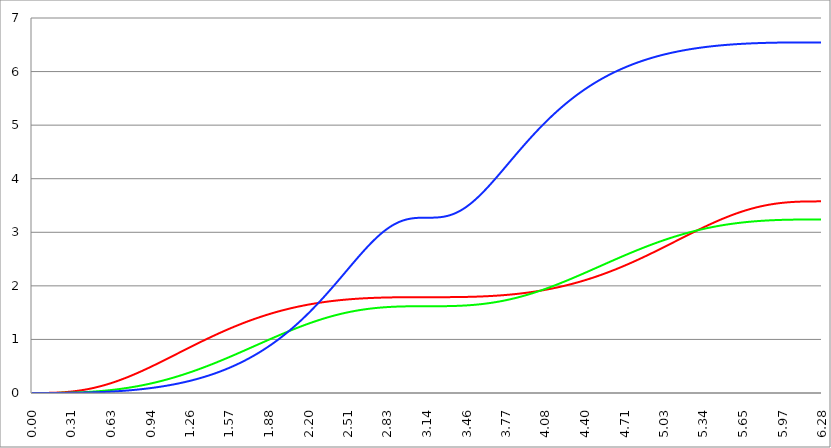
| Category | Series 1 | Series 0 | Series 2 |
|---|---|---|---|
| 0.0 | 0 | 0 | 0 |
| 0.00314159265358979 | 0 | 0 | 0 |
| 0.00628318530717958 | 0 | 0 | 0 |
| 0.00942477796076938 | 0 | 0 | 0 |
| 0.0125663706143592 | 0 | 0 | 0 |
| 0.015707963267949 | 0 | 0 | 0 |
| 0.0188495559215388 | 0 | 0 | 0 |
| 0.0219911485751285 | 0 | 0 | 0 |
| 0.0251327412287183 | 0 | 0 | 0 |
| 0.0282743338823081 | 0 | 0 | 0 |
| 0.0314159265358979 | 0 | 0 | 0 |
| 0.0345575191894877 | 0 | 0 | 0 |
| 0.0376991118430775 | 0 | 0 | 0 |
| 0.0408407044966673 | 0 | 0 | 0 |
| 0.0439822971502571 | 0 | 0 | 0 |
| 0.0471238898038469 | 0 | 0 | 0 |
| 0.0502654824574367 | 0 | 0 | 0 |
| 0.0534070751110265 | 0 | 0 | 0 |
| 0.0565486677646163 | 0 | 0 | 0 |
| 0.059690260418206 | 0 | 0 | 0 |
| 0.0628318530717958 | 0 | 0 | 0 |
| 0.0659734457253856 | 0 | 0 | 0 |
| 0.0691150383789754 | 0 | 0 | 0 |
| 0.0722566310325652 | 0 | 0 | 0 |
| 0.075398223686155 | 0 | 0 | 0 |
| 0.0785398163397448 | 0 | 0 | 0 |
| 0.0816814089933346 | 0.001 | 0 | 0 |
| 0.0848230016469244 | 0.001 | 0 | 0 |
| 0.0879645943005142 | 0.001 | 0 | 0 |
| 0.091106186954104 | 0.001 | 0 | 0 |
| 0.0942477796076937 | 0.001 | 0 | 0 |
| 0.0973893722612835 | 0.001 | 0 | 0 |
| 0.100530964914873 | 0.001 | 0 | 0 |
| 0.103672557568463 | 0.001 | 0 | 0 |
| 0.106814150222053 | 0.001 | 0 | 0 |
| 0.109955742875643 | 0.001 | 0 | 0 |
| 0.113097335529233 | 0.001 | 0 | 0 |
| 0.116238928182822 | 0.001 | 0 | 0 |
| 0.119380520836412 | 0.002 | 0 | 0 |
| 0.122522113490002 | 0.002 | 0 | 0 |
| 0.125663706143592 | 0.002 | 0 | 0 |
| 0.128805298797181 | 0.002 | 0 | 0 |
| 0.131946891450771 | 0.002 | 0.001 | 0 |
| 0.135088484104361 | 0.002 | 0.001 | 0 |
| 0.138230076757951 | 0.002 | 0.001 | 0 |
| 0.141371669411541 | 0.003 | 0.001 | 0 |
| 0.14451326206513 | 0.003 | 0.001 | 0 |
| 0.14765485471872 | 0.003 | 0.001 | 0 |
| 0.15079644737231 | 0.003 | 0.001 | 0 |
| 0.1539380400259 | 0.003 | 0.001 | 0 |
| 0.15707963267949 | 0.004 | 0.001 | 0 |
| 0.160221225333079 | 0.004 | 0.001 | 0 |
| 0.163362817986669 | 0.004 | 0.001 | 0 |
| 0.166504410640259 | 0.004 | 0.001 | 0 |
| 0.169646003293849 | 0.004 | 0.001 | 0.001 |
| 0.172787595947439 | 0.005 | 0.001 | 0.001 |
| 0.175929188601028 | 0.005 | 0.001 | 0.001 |
| 0.179070781254618 | 0.005 | 0.001 | 0.001 |
| 0.182212373908208 | 0.005 | 0.001 | 0.001 |
| 0.185353966561798 | 0.006 | 0.001 | 0.001 |
| 0.188495559215388 | 0.006 | 0.002 | 0.001 |
| 0.191637151868977 | 0.006 | 0.002 | 0.001 |
| 0.194778744522567 | 0.007 | 0.002 | 0.001 |
| 0.197920337176157 | 0.007 | 0.002 | 0.001 |
| 0.201061929829747 | 0.007 | 0.002 | 0.001 |
| 0.204203522483336 | 0.008 | 0.002 | 0.001 |
| 0.207345115136926 | 0.008 | 0.002 | 0.001 |
| 0.210486707790516 | 0.008 | 0.002 | 0.001 |
| 0.213628300444106 | 0.009 | 0.002 | 0.001 |
| 0.216769893097696 | 0.009 | 0.002 | 0.001 |
| 0.219911485751285 | 0.01 | 0.002 | 0.001 |
| 0.223053078404875 | 0.01 | 0.003 | 0.001 |
| 0.226194671058465 | 0.01 | 0.003 | 0.001 |
| 0.229336263712055 | 0.011 | 0.003 | 0.001 |
| 0.232477856365645 | 0.011 | 0.003 | 0.001 |
| 0.235619449019234 | 0.012 | 0.003 | 0.001 |
| 0.238761041672824 | 0.012 | 0.003 | 0.001 |
| 0.241902634326414 | 0.013 | 0.003 | 0.001 |
| 0.245044226980004 | 0.013 | 0.003 | 0.002 |
| 0.248185819633594 | 0.014 | 0.004 | 0.002 |
| 0.251327412287183 | 0.014 | 0.004 | 0.002 |
| 0.254469004940773 | 0.015 | 0.004 | 0.002 |
| 0.257610597594363 | 0.015 | 0.004 | 0.002 |
| 0.260752190247953 | 0.016 | 0.004 | 0.002 |
| 0.263893782901543 | 0.016 | 0.004 | 0.002 |
| 0.267035375555132 | 0.017 | 0.004 | 0.002 |
| 0.270176968208722 | 0.017 | 0.005 | 0.002 |
| 0.273318560862312 | 0.018 | 0.005 | 0.002 |
| 0.276460153515902 | 0.019 | 0.005 | 0.002 |
| 0.279601746169492 | 0.019 | 0.005 | 0.002 |
| 0.282743338823082 | 0.02 | 0.005 | 0.002 |
| 0.285884931476671 | 0.021 | 0.005 | 0.002 |
| 0.289026524130261 | 0.021 | 0.006 | 0.002 |
| 0.292168116783851 | 0.022 | 0.006 | 0.003 |
| 0.295309709437441 | 0.023 | 0.006 | 0.003 |
| 0.298451302091031 | 0.023 | 0.006 | 0.003 |
| 0.30159289474462 | 0.024 | 0.006 | 0.003 |
| 0.30473448739821 | 0.025 | 0.006 | 0.003 |
| 0.3078760800518 | 0.026 | 0.007 | 0.003 |
| 0.31101767270539 | 0.026 | 0.007 | 0.003 |
| 0.31415926535898 | 0.027 | 0.007 | 0.003 |
| 0.31730085801257 | 0.028 | 0.007 | 0.003 |
| 0.320442450666159 | 0.029 | 0.008 | 0.003 |
| 0.323584043319749 | 0.029 | 0.008 | 0.004 |
| 0.326725635973339 | 0.03 | 0.008 | 0.004 |
| 0.329867228626929 | 0.031 | 0.008 | 0.004 |
| 0.333008821280519 | 0.032 | 0.008 | 0.004 |
| 0.336150413934108 | 0.033 | 0.009 | 0.004 |
| 0.339292006587698 | 0.034 | 0.009 | 0.004 |
| 0.342433599241288 | 0.035 | 0.009 | 0.004 |
| 0.345575191894878 | 0.036 | 0.009 | 0.004 |
| 0.348716784548468 | 0.037 | 0.01 | 0.004 |
| 0.351858377202058 | 0.038 | 0.01 | 0.005 |
| 0.354999969855647 | 0.038 | 0.01 | 0.005 |
| 0.358141562509237 | 0.039 | 0.01 | 0.005 |
| 0.361283155162827 | 0.04 | 0.011 | 0.005 |
| 0.364424747816417 | 0.041 | 0.011 | 0.005 |
| 0.367566340470007 | 0.042 | 0.011 | 0.005 |
| 0.370707933123597 | 0.044 | 0.012 | 0.005 |
| 0.373849525777186 | 0.045 | 0.012 | 0.005 |
| 0.376991118430776 | 0.046 | 0.012 | 0.006 |
| 0.380132711084366 | 0.047 | 0.013 | 0.006 |
| 0.383274303737956 | 0.048 | 0.013 | 0.006 |
| 0.386415896391546 | 0.049 | 0.013 | 0.006 |
| 0.389557489045135 | 0.05 | 0.013 | 0.006 |
| 0.392699081698725 | 0.051 | 0.014 | 0.006 |
| 0.395840674352315 | 0.052 | 0.014 | 0.006 |
| 0.398982267005905 | 0.054 | 0.014 | 0.007 |
| 0.402123859659495 | 0.055 | 0.015 | 0.007 |
| 0.405265452313085 | 0.056 | 0.015 | 0.007 |
| 0.408407044966674 | 0.057 | 0.016 | 0.007 |
| 0.411548637620264 | 0.058 | 0.016 | 0.007 |
| 0.414690230273854 | 0.06 | 0.016 | 0.007 |
| 0.417831822927444 | 0.061 | 0.017 | 0.008 |
| 0.420973415581034 | 0.062 | 0.017 | 0.008 |
| 0.424115008234623 | 0.064 | 0.017 | 0.008 |
| 0.427256600888213 | 0.065 | 0.018 | 0.008 |
| 0.430398193541803 | 0.066 | 0.018 | 0.008 |
| 0.433539786195393 | 0.068 | 0.019 | 0.008 |
| 0.436681378848983 | 0.069 | 0.019 | 0.009 |
| 0.439822971502573 | 0.07 | 0.019 | 0.009 |
| 0.442964564156162 | 0.072 | 0.02 | 0.009 |
| 0.446106156809752 | 0.073 | 0.02 | 0.009 |
| 0.449247749463342 | 0.075 | 0.021 | 0.009 |
| 0.452389342116932 | 0.076 | 0.021 | 0.01 |
| 0.455530934770522 | 0.078 | 0.021 | 0.01 |
| 0.458672527424111 | 0.079 | 0.022 | 0.01 |
| 0.461814120077701 | 0.081 | 0.022 | 0.01 |
| 0.464955712731291 | 0.082 | 0.023 | 0.01 |
| 0.468097305384881 | 0.084 | 0.023 | 0.011 |
| 0.471238898038471 | 0.085 | 0.024 | 0.011 |
| 0.474380490692061 | 0.087 | 0.024 | 0.011 |
| 0.47752208334565 | 0.088 | 0.025 | 0.011 |
| 0.48066367599924 | 0.09 | 0.025 | 0.012 |
| 0.48380526865283 | 0.092 | 0.026 | 0.012 |
| 0.48694686130642 | 0.093 | 0.026 | 0.012 |
| 0.49008845396001 | 0.095 | 0.027 | 0.012 |
| 0.493230046613599 | 0.097 | 0.027 | 0.013 |
| 0.496371639267189 | 0.098 | 0.028 | 0.013 |
| 0.499513231920779 | 0.1 | 0.028 | 0.013 |
| 0.502654824574369 | 0.102 | 0.029 | 0.013 |
| 0.505796417227959 | 0.103 | 0.029 | 0.014 |
| 0.508938009881549 | 0.105 | 0.03 | 0.014 |
| 0.512079602535138 | 0.107 | 0.03 | 0.014 |
| 0.515221195188728 | 0.109 | 0.031 | 0.014 |
| 0.518362787842318 | 0.111 | 0.031 | 0.015 |
| 0.521504380495908 | 0.112 | 0.032 | 0.015 |
| 0.524645973149498 | 0.114 | 0.033 | 0.015 |
| 0.527787565803087 | 0.116 | 0.033 | 0.015 |
| 0.530929158456677 | 0.118 | 0.034 | 0.016 |
| 0.534070751110267 | 0.12 | 0.034 | 0.016 |
| 0.537212343763857 | 0.122 | 0.035 | 0.016 |
| 0.540353936417447 | 0.124 | 0.035 | 0.017 |
| 0.543495529071037 | 0.126 | 0.036 | 0.017 |
| 0.546637121724626 | 0.127 | 0.037 | 0.017 |
| 0.549778714378216 | 0.129 | 0.037 | 0.017 |
| 0.552920307031806 | 0.131 | 0.038 | 0.018 |
| 0.556061899685396 | 0.133 | 0.039 | 0.018 |
| 0.559203492338986 | 0.135 | 0.039 | 0.018 |
| 0.562345084992576 | 0.137 | 0.04 | 0.019 |
| 0.565486677646165 | 0.14 | 0.041 | 0.019 |
| 0.568628270299755 | 0.142 | 0.041 | 0.019 |
| 0.571769862953345 | 0.144 | 0.042 | 0.02 |
| 0.574911455606935 | 0.146 | 0.043 | 0.02 |
| 0.578053048260525 | 0.148 | 0.043 | 0.02 |
| 0.581194640914114 | 0.15 | 0.044 | 0.021 |
| 0.584336233567704 | 0.152 | 0.045 | 0.021 |
| 0.587477826221294 | 0.154 | 0.045 | 0.021 |
| 0.590619418874884 | 0.156 | 0.046 | 0.022 |
| 0.593761011528474 | 0.159 | 0.047 | 0.022 |
| 0.596902604182064 | 0.161 | 0.047 | 0.022 |
| 0.600044196835653 | 0.163 | 0.048 | 0.023 |
| 0.603185789489243 | 0.165 | 0.049 | 0.023 |
| 0.606327382142833 | 0.168 | 0.05 | 0.024 |
| 0.609468974796423 | 0.17 | 0.05 | 0.024 |
| 0.612610567450013 | 0.172 | 0.051 | 0.024 |
| 0.615752160103602 | 0.174 | 0.052 | 0.025 |
| 0.618893752757192 | 0.177 | 0.053 | 0.025 |
| 0.622035345410782 | 0.179 | 0.054 | 0.025 |
| 0.625176938064372 | 0.181 | 0.054 | 0.026 |
| 0.628318530717962 | 0.184 | 0.055 | 0.026 |
| 0.631460123371551 | 0.186 | 0.056 | 0.027 |
| 0.634601716025141 | 0.189 | 0.057 | 0.027 |
| 0.637743308678731 | 0.191 | 0.058 | 0.027 |
| 0.640884901332321 | 0.193 | 0.058 | 0.028 |
| 0.644026493985911 | 0.196 | 0.059 | 0.028 |
| 0.647168086639501 | 0.198 | 0.06 | 0.029 |
| 0.65030967929309 | 0.201 | 0.061 | 0.029 |
| 0.65345127194668 | 0.203 | 0.062 | 0.03 |
| 0.65659286460027 | 0.206 | 0.063 | 0.03 |
| 0.65973445725386 | 0.208 | 0.064 | 0.03 |
| 0.66287604990745 | 0.211 | 0.064 | 0.031 |
| 0.666017642561039 | 0.213 | 0.065 | 0.031 |
| 0.669159235214629 | 0.216 | 0.066 | 0.032 |
| 0.672300827868219 | 0.219 | 0.067 | 0.032 |
| 0.675442420521809 | 0.221 | 0.068 | 0.033 |
| 0.678584013175399 | 0.224 | 0.069 | 0.033 |
| 0.681725605828989 | 0.226 | 0.07 | 0.034 |
| 0.684867198482578 | 0.229 | 0.071 | 0.034 |
| 0.688008791136168 | 0.232 | 0.072 | 0.035 |
| 0.691150383789758 | 0.234 | 0.073 | 0.035 |
| 0.694291976443348 | 0.237 | 0.074 | 0.036 |
| 0.697433569096938 | 0.24 | 0.075 | 0.036 |
| 0.700575161750528 | 0.242 | 0.076 | 0.037 |
| 0.703716754404117 | 0.245 | 0.077 | 0.037 |
| 0.706858347057707 | 0.248 | 0.078 | 0.038 |
| 0.709999939711297 | 0.251 | 0.079 | 0.038 |
| 0.713141532364887 | 0.253 | 0.08 | 0.039 |
| 0.716283125018477 | 0.256 | 0.081 | 0.039 |
| 0.719424717672066 | 0.259 | 0.082 | 0.04 |
| 0.722566310325656 | 0.262 | 0.083 | 0.04 |
| 0.725707902979246 | 0.264 | 0.084 | 0.041 |
| 0.728849495632836 | 0.267 | 0.085 | 0.041 |
| 0.731991088286426 | 0.27 | 0.086 | 0.042 |
| 0.735132680940016 | 0.273 | 0.087 | 0.042 |
| 0.738274273593605 | 0.276 | 0.088 | 0.043 |
| 0.741415866247195 | 0.279 | 0.089 | 0.044 |
| 0.744557458900785 | 0.282 | 0.09 | 0.044 |
| 0.747699051554375 | 0.285 | 0.091 | 0.045 |
| 0.750840644207965 | 0.287 | 0.092 | 0.045 |
| 0.753982236861554 | 0.29 | 0.094 | 0.046 |
| 0.757123829515144 | 0.293 | 0.095 | 0.046 |
| 0.760265422168734 | 0.296 | 0.096 | 0.047 |
| 0.763407014822324 | 0.299 | 0.097 | 0.048 |
| 0.766548607475914 | 0.302 | 0.098 | 0.048 |
| 0.769690200129504 | 0.305 | 0.099 | 0.049 |
| 0.772831792783093 | 0.308 | 0.1 | 0.049 |
| 0.775973385436683 | 0.311 | 0.102 | 0.05 |
| 0.779114978090273 | 0.314 | 0.103 | 0.051 |
| 0.782256570743863 | 0.317 | 0.104 | 0.051 |
| 0.785398163397453 | 0.32 | 0.105 | 0.052 |
| 0.788539756051042 | 0.323 | 0.106 | 0.053 |
| 0.791681348704632 | 0.326 | 0.108 | 0.053 |
| 0.794822941358222 | 0.33 | 0.109 | 0.054 |
| 0.797964534011812 | 0.333 | 0.11 | 0.055 |
| 0.801106126665402 | 0.336 | 0.111 | 0.055 |
| 0.804247719318992 | 0.339 | 0.113 | 0.056 |
| 0.807389311972581 | 0.342 | 0.114 | 0.057 |
| 0.810530904626171 | 0.345 | 0.115 | 0.057 |
| 0.813672497279761 | 0.348 | 0.116 | 0.058 |
| 0.816814089933351 | 0.351 | 0.118 | 0.059 |
| 0.819955682586941 | 0.355 | 0.119 | 0.059 |
| 0.823097275240531 | 0.358 | 0.12 | 0.06 |
| 0.82623886789412 | 0.361 | 0.122 | 0.061 |
| 0.82938046054771 | 0.364 | 0.123 | 0.061 |
| 0.8325220532013 | 0.367 | 0.124 | 0.062 |
| 0.83566364585489 | 0.371 | 0.126 | 0.063 |
| 0.83880523850848 | 0.374 | 0.127 | 0.064 |
| 0.841946831162069 | 0.377 | 0.128 | 0.064 |
| 0.845088423815659 | 0.38 | 0.13 | 0.065 |
| 0.848230016469249 | 0.384 | 0.131 | 0.066 |
| 0.851371609122839 | 0.387 | 0.132 | 0.067 |
| 0.854513201776429 | 0.39 | 0.134 | 0.067 |
| 0.857654794430019 | 0.393 | 0.135 | 0.068 |
| 0.860796387083608 | 0.397 | 0.137 | 0.069 |
| 0.863937979737198 | 0.4 | 0.138 | 0.07 |
| 0.867079572390788 | 0.403 | 0.139 | 0.071 |
| 0.870221165044378 | 0.407 | 0.141 | 0.071 |
| 0.873362757697968 | 0.41 | 0.142 | 0.072 |
| 0.876504350351557 | 0.413 | 0.144 | 0.073 |
| 0.879645943005147 | 0.417 | 0.145 | 0.074 |
| 0.882787535658737 | 0.42 | 0.147 | 0.075 |
| 0.885929128312327 | 0.423 | 0.148 | 0.075 |
| 0.889070720965917 | 0.427 | 0.15 | 0.076 |
| 0.892212313619507 | 0.43 | 0.151 | 0.077 |
| 0.895353906273096 | 0.434 | 0.153 | 0.078 |
| 0.898495498926686 | 0.437 | 0.154 | 0.079 |
| 0.901637091580276 | 0.44 | 0.156 | 0.08 |
| 0.904778684233866 | 0.444 | 0.157 | 0.081 |
| 0.907920276887456 | 0.447 | 0.159 | 0.081 |
| 0.911061869541045 | 0.451 | 0.16 | 0.082 |
| 0.914203462194635 | 0.454 | 0.162 | 0.083 |
| 0.917345054848225 | 0.458 | 0.163 | 0.084 |
| 0.920486647501815 | 0.461 | 0.165 | 0.085 |
| 0.923628240155405 | 0.465 | 0.167 | 0.086 |
| 0.926769832808995 | 0.468 | 0.168 | 0.087 |
| 0.929911425462584 | 0.472 | 0.17 | 0.088 |
| 0.933053018116174 | 0.475 | 0.171 | 0.089 |
| 0.936194610769764 | 0.479 | 0.173 | 0.09 |
| 0.939336203423354 | 0.482 | 0.175 | 0.09 |
| 0.942477796076944 | 0.486 | 0.176 | 0.091 |
| 0.945619388730533 | 0.489 | 0.178 | 0.092 |
| 0.948760981384123 | 0.493 | 0.18 | 0.093 |
| 0.951902574037713 | 0.496 | 0.181 | 0.094 |
| 0.955044166691303 | 0.5 | 0.183 | 0.095 |
| 0.958185759344893 | 0.503 | 0.185 | 0.096 |
| 0.961327351998483 | 0.507 | 0.186 | 0.097 |
| 0.964468944652072 | 0.51 | 0.188 | 0.098 |
| 0.967610537305662 | 0.514 | 0.19 | 0.099 |
| 0.970752129959252 | 0.517 | 0.192 | 0.1 |
| 0.973893722612842 | 0.521 | 0.193 | 0.101 |
| 0.977035315266432 | 0.525 | 0.195 | 0.102 |
| 0.980176907920022 | 0.528 | 0.197 | 0.103 |
| 0.983318500573611 | 0.532 | 0.199 | 0.104 |
| 0.986460093227201 | 0.535 | 0.2 | 0.105 |
| 0.989601685880791 | 0.539 | 0.202 | 0.107 |
| 0.992743278534381 | 0.543 | 0.204 | 0.108 |
| 0.995884871187971 | 0.546 | 0.206 | 0.109 |
| 0.99902646384156 | 0.55 | 0.207 | 0.11 |
| 1.00216805649515 | 0.553 | 0.209 | 0.111 |
| 1.00530964914874 | 0.557 | 0.211 | 0.112 |
| 1.00845124180233 | 0.561 | 0.213 | 0.113 |
| 1.01159283445592 | 0.564 | 0.215 | 0.114 |
| 1.01473442710951 | 0.568 | 0.217 | 0.115 |
| 1.017876019763099 | 0.572 | 0.218 | 0.116 |
| 1.021017612416689 | 0.575 | 0.22 | 0.117 |
| 1.02415920507028 | 0.579 | 0.222 | 0.119 |
| 1.027300797723869 | 0.583 | 0.224 | 0.12 |
| 1.030442390377459 | 0.586 | 0.226 | 0.121 |
| 1.033583983031048 | 0.59 | 0.228 | 0.122 |
| 1.036725575684638 | 0.594 | 0.23 | 0.123 |
| 1.039867168338228 | 0.597 | 0.232 | 0.124 |
| 1.043008760991818 | 0.601 | 0.234 | 0.126 |
| 1.046150353645408 | 0.605 | 0.236 | 0.127 |
| 1.049291946298998 | 0.608 | 0.238 | 0.128 |
| 1.052433538952587 | 0.612 | 0.24 | 0.129 |
| 1.055575131606177 | 0.616 | 0.241 | 0.13 |
| 1.058716724259767 | 0.619 | 0.243 | 0.132 |
| 1.061858316913357 | 0.623 | 0.245 | 0.133 |
| 1.064999909566947 | 0.627 | 0.247 | 0.134 |
| 1.068141502220536 | 0.63 | 0.249 | 0.135 |
| 1.071283094874126 | 0.634 | 0.251 | 0.137 |
| 1.074424687527716 | 0.638 | 0.253 | 0.138 |
| 1.077566280181306 | 0.642 | 0.255 | 0.139 |
| 1.080707872834896 | 0.645 | 0.258 | 0.141 |
| 1.083849465488486 | 0.649 | 0.26 | 0.142 |
| 1.086991058142075 | 0.653 | 0.262 | 0.143 |
| 1.090132650795665 | 0.656 | 0.264 | 0.144 |
| 1.093274243449255 | 0.66 | 0.266 | 0.146 |
| 1.096415836102845 | 0.664 | 0.268 | 0.147 |
| 1.099557428756435 | 0.668 | 0.27 | 0.148 |
| 1.102699021410025 | 0.671 | 0.272 | 0.15 |
| 1.105840614063614 | 0.675 | 0.274 | 0.151 |
| 1.108982206717204 | 0.679 | 0.276 | 0.152 |
| 1.112123799370794 | 0.682 | 0.278 | 0.154 |
| 1.115265392024384 | 0.686 | 0.281 | 0.155 |
| 1.118406984677974 | 0.69 | 0.283 | 0.157 |
| 1.121548577331563 | 0.694 | 0.285 | 0.158 |
| 1.124690169985153 | 0.697 | 0.287 | 0.159 |
| 1.127831762638743 | 0.701 | 0.289 | 0.161 |
| 1.130973355292333 | 0.705 | 0.291 | 0.162 |
| 1.134114947945923 | 0.709 | 0.294 | 0.164 |
| 1.137256540599513 | 0.712 | 0.296 | 0.165 |
| 1.140398133253102 | 0.716 | 0.298 | 0.167 |
| 1.143539725906692 | 0.72 | 0.3 | 0.168 |
| 1.146681318560282 | 0.724 | 0.302 | 0.17 |
| 1.149822911213872 | 0.727 | 0.305 | 0.171 |
| 1.152964503867462 | 0.731 | 0.307 | 0.173 |
| 1.156106096521051 | 0.735 | 0.309 | 0.174 |
| 1.159247689174641 | 0.738 | 0.311 | 0.176 |
| 1.162389281828231 | 0.742 | 0.314 | 0.177 |
| 1.165530874481821 | 0.746 | 0.316 | 0.179 |
| 1.168672467135411 | 0.75 | 0.318 | 0.18 |
| 1.171814059789001 | 0.753 | 0.32 | 0.182 |
| 1.17495565244259 | 0.757 | 0.323 | 0.183 |
| 1.17809724509618 | 0.761 | 0.325 | 0.185 |
| 1.18123883774977 | 0.765 | 0.327 | 0.186 |
| 1.18438043040336 | 0.768 | 0.33 | 0.188 |
| 1.18752202305695 | 0.772 | 0.332 | 0.19 |
| 1.190663615710539 | 0.776 | 0.334 | 0.191 |
| 1.193805208364129 | 0.78 | 0.337 | 0.193 |
| 1.19694680101772 | 0.783 | 0.339 | 0.194 |
| 1.200088393671309 | 0.787 | 0.342 | 0.196 |
| 1.203229986324899 | 0.791 | 0.344 | 0.198 |
| 1.206371578978489 | 0.795 | 0.346 | 0.199 |
| 1.209513171632078 | 0.798 | 0.349 | 0.201 |
| 1.212654764285668 | 0.802 | 0.351 | 0.203 |
| 1.215796356939258 | 0.806 | 0.353 | 0.204 |
| 1.218937949592848 | 0.809 | 0.356 | 0.206 |
| 1.222079542246438 | 0.813 | 0.358 | 0.208 |
| 1.225221134900027 | 0.817 | 0.361 | 0.209 |
| 1.228362727553617 | 0.821 | 0.363 | 0.211 |
| 1.231504320207207 | 0.824 | 0.366 | 0.213 |
| 1.234645912860797 | 0.828 | 0.368 | 0.215 |
| 1.237787505514387 | 0.832 | 0.371 | 0.216 |
| 1.240929098167977 | 0.835 | 0.373 | 0.218 |
| 1.244070690821566 | 0.839 | 0.376 | 0.22 |
| 1.247212283475156 | 0.843 | 0.378 | 0.222 |
| 1.250353876128746 | 0.847 | 0.381 | 0.224 |
| 1.253495468782336 | 0.85 | 0.383 | 0.225 |
| 1.256637061435926 | 0.854 | 0.386 | 0.227 |
| 1.259778654089515 | 0.858 | 0.388 | 0.229 |
| 1.262920246743105 | 0.861 | 0.391 | 0.231 |
| 1.266061839396695 | 0.865 | 0.393 | 0.233 |
| 1.269203432050285 | 0.869 | 0.396 | 0.235 |
| 1.272345024703875 | 0.872 | 0.398 | 0.236 |
| 1.275486617357465 | 0.876 | 0.401 | 0.238 |
| 1.278628210011054 | 0.88 | 0.403 | 0.24 |
| 1.281769802664644 | 0.884 | 0.406 | 0.242 |
| 1.284911395318234 | 0.887 | 0.409 | 0.244 |
| 1.288052987971824 | 0.891 | 0.411 | 0.246 |
| 1.291194580625414 | 0.895 | 0.414 | 0.248 |
| 1.294336173279003 | 0.898 | 0.416 | 0.25 |
| 1.297477765932593 | 0.902 | 0.419 | 0.252 |
| 1.300619358586183 | 0.906 | 0.422 | 0.254 |
| 1.303760951239773 | 0.909 | 0.424 | 0.256 |
| 1.306902543893363 | 0.913 | 0.427 | 0.258 |
| 1.310044136546953 | 0.916 | 0.43 | 0.26 |
| 1.313185729200542 | 0.92 | 0.432 | 0.262 |
| 1.316327321854132 | 0.924 | 0.435 | 0.264 |
| 1.319468914507722 | 0.927 | 0.438 | 0.266 |
| 1.322610507161312 | 0.931 | 0.44 | 0.268 |
| 1.325752099814902 | 0.935 | 0.443 | 0.27 |
| 1.328893692468491 | 0.938 | 0.446 | 0.272 |
| 1.332035285122081 | 0.942 | 0.448 | 0.274 |
| 1.335176877775671 | 0.946 | 0.451 | 0.276 |
| 1.338318470429261 | 0.949 | 0.454 | 0.278 |
| 1.341460063082851 | 0.953 | 0.456 | 0.281 |
| 1.344601655736441 | 0.956 | 0.459 | 0.283 |
| 1.34774324839003 | 0.96 | 0.462 | 0.285 |
| 1.35088484104362 | 0.964 | 0.465 | 0.287 |
| 1.35402643369721 | 0.967 | 0.467 | 0.289 |
| 1.3571680263508 | 0.971 | 0.47 | 0.291 |
| 1.36030961900439 | 0.974 | 0.473 | 0.294 |
| 1.363451211657979 | 0.978 | 0.476 | 0.296 |
| 1.36659280431157 | 0.981 | 0.478 | 0.298 |
| 1.369734396965159 | 0.985 | 0.481 | 0.3 |
| 1.372875989618749 | 0.989 | 0.484 | 0.303 |
| 1.376017582272339 | 0.992 | 0.487 | 0.305 |
| 1.379159174925929 | 0.996 | 0.49 | 0.307 |
| 1.382300767579518 | 0.999 | 0.492 | 0.309 |
| 1.385442360233108 | 1.003 | 0.495 | 0.312 |
| 1.388583952886698 | 1.006 | 0.498 | 0.314 |
| 1.391725545540288 | 1.01 | 0.501 | 0.316 |
| 1.394867138193878 | 1.013 | 0.504 | 0.319 |
| 1.398008730847468 | 1.017 | 0.507 | 0.321 |
| 1.401150323501057 | 1.02 | 0.509 | 0.323 |
| 1.404291916154647 | 1.024 | 0.512 | 0.326 |
| 1.407433508808237 | 1.027 | 0.515 | 0.328 |
| 1.410575101461827 | 1.031 | 0.518 | 0.331 |
| 1.413716694115417 | 1.034 | 0.521 | 0.333 |
| 1.416858286769006 | 1.038 | 0.524 | 0.335 |
| 1.419999879422596 | 1.041 | 0.527 | 0.338 |
| 1.423141472076186 | 1.045 | 0.53 | 0.34 |
| 1.426283064729776 | 1.048 | 0.533 | 0.343 |
| 1.429424657383366 | 1.052 | 0.535 | 0.345 |
| 1.432566250036956 | 1.055 | 0.538 | 0.348 |
| 1.435707842690545 | 1.059 | 0.541 | 0.35 |
| 1.438849435344135 | 1.062 | 0.544 | 0.353 |
| 1.441991027997725 | 1.066 | 0.547 | 0.355 |
| 1.445132620651315 | 1.069 | 0.55 | 0.358 |
| 1.448274213304905 | 1.072 | 0.553 | 0.36 |
| 1.451415805958494 | 1.076 | 0.556 | 0.363 |
| 1.454557398612084 | 1.079 | 0.559 | 0.366 |
| 1.457698991265674 | 1.083 | 0.562 | 0.368 |
| 1.460840583919264 | 1.086 | 0.565 | 0.371 |
| 1.463982176572854 | 1.089 | 0.568 | 0.373 |
| 1.467123769226444 | 1.093 | 0.571 | 0.376 |
| 1.470265361880033 | 1.096 | 0.574 | 0.379 |
| 1.473406954533623 | 1.1 | 0.577 | 0.381 |
| 1.476548547187213 | 1.103 | 0.58 | 0.384 |
| 1.479690139840803 | 1.106 | 0.583 | 0.387 |
| 1.482831732494393 | 1.11 | 0.586 | 0.389 |
| 1.485973325147982 | 1.113 | 0.589 | 0.392 |
| 1.489114917801572 | 1.116 | 0.592 | 0.395 |
| 1.492256510455162 | 1.12 | 0.595 | 0.398 |
| 1.495398103108752 | 1.123 | 0.598 | 0.4 |
| 1.498539695762342 | 1.126 | 0.601 | 0.403 |
| 1.501681288415932 | 1.13 | 0.604 | 0.406 |
| 1.504822881069521 | 1.133 | 0.607 | 0.409 |
| 1.507964473723111 | 1.136 | 0.61 | 0.412 |
| 1.511106066376701 | 1.139 | 0.613 | 0.415 |
| 1.514247659030291 | 1.143 | 0.616 | 0.417 |
| 1.517389251683881 | 1.146 | 0.619 | 0.42 |
| 1.520530844337471 | 1.149 | 0.622 | 0.423 |
| 1.52367243699106 | 1.153 | 0.625 | 0.426 |
| 1.52681402964465 | 1.156 | 0.628 | 0.429 |
| 1.52995562229824 | 1.159 | 0.632 | 0.432 |
| 1.53309721495183 | 1.162 | 0.635 | 0.435 |
| 1.53623880760542 | 1.166 | 0.638 | 0.438 |
| 1.539380400259009 | 1.169 | 0.641 | 0.441 |
| 1.542521992912599 | 1.172 | 0.644 | 0.444 |
| 1.545663585566189 | 1.175 | 0.647 | 0.447 |
| 1.548805178219779 | 1.178 | 0.65 | 0.45 |
| 1.551946770873369 | 1.182 | 0.653 | 0.453 |
| 1.555088363526959 | 1.185 | 0.656 | 0.456 |
| 1.558229956180548 | 1.188 | 0.659 | 0.459 |
| 1.561371548834138 | 1.191 | 0.663 | 0.462 |
| 1.564513141487728 | 1.194 | 0.666 | 0.465 |
| 1.567654734141318 | 1.197 | 0.669 | 0.468 |
| 1.570796326794908 | 1.201 | 0.672 | 0.471 |
| 1.573937919448497 | 1.204 | 0.675 | 0.475 |
| 1.577079512102087 | 1.207 | 0.678 | 0.478 |
| 1.580221104755677 | 1.21 | 0.681 | 0.481 |
| 1.583362697409267 | 1.213 | 0.685 | 0.484 |
| 1.586504290062857 | 1.216 | 0.688 | 0.487 |
| 1.589645882716447 | 1.219 | 0.691 | 0.491 |
| 1.592787475370036 | 1.222 | 0.694 | 0.494 |
| 1.595929068023626 | 1.225 | 0.697 | 0.497 |
| 1.599070660677216 | 1.228 | 0.7 | 0.5 |
| 1.602212253330806 | 1.232 | 0.704 | 0.504 |
| 1.605353845984396 | 1.235 | 0.707 | 0.507 |
| 1.608495438637985 | 1.238 | 0.71 | 0.51 |
| 1.611637031291575 | 1.241 | 0.713 | 0.514 |
| 1.614778623945165 | 1.244 | 0.716 | 0.517 |
| 1.617920216598755 | 1.247 | 0.72 | 0.52 |
| 1.621061809252345 | 1.25 | 0.723 | 0.524 |
| 1.624203401905935 | 1.253 | 0.726 | 0.527 |
| 1.627344994559524 | 1.256 | 0.729 | 0.531 |
| 1.630486587213114 | 1.259 | 0.732 | 0.534 |
| 1.633628179866704 | 1.262 | 0.736 | 0.537 |
| 1.636769772520294 | 1.265 | 0.739 | 0.541 |
| 1.639911365173884 | 1.268 | 0.742 | 0.544 |
| 1.643052957827473 | 1.271 | 0.745 | 0.548 |
| 1.646194550481063 | 1.274 | 0.748 | 0.551 |
| 1.649336143134653 | 1.277 | 0.752 | 0.555 |
| 1.652477735788243 | 1.279 | 0.755 | 0.559 |
| 1.655619328441833 | 1.282 | 0.758 | 0.562 |
| 1.658760921095423 | 1.285 | 0.761 | 0.566 |
| 1.661902513749012 | 1.288 | 0.765 | 0.569 |
| 1.665044106402602 | 1.291 | 0.768 | 0.573 |
| 1.668185699056192 | 1.294 | 0.771 | 0.577 |
| 1.671327291709782 | 1.297 | 0.774 | 0.58 |
| 1.674468884363372 | 1.3 | 0.778 | 0.584 |
| 1.677610477016961 | 1.303 | 0.781 | 0.588 |
| 1.680752069670551 | 1.305 | 0.784 | 0.591 |
| 1.683893662324141 | 1.308 | 0.787 | 0.595 |
| 1.687035254977731 | 1.311 | 0.79 | 0.599 |
| 1.690176847631321 | 1.314 | 0.794 | 0.603 |
| 1.693318440284911 | 1.317 | 0.797 | 0.607 |
| 1.6964600329385 | 1.32 | 0.8 | 0.61 |
| 1.69960162559209 | 1.322 | 0.803 | 0.614 |
| 1.70274321824568 | 1.325 | 0.807 | 0.618 |
| 1.70588481089927 | 1.328 | 0.81 | 0.622 |
| 1.70902640355286 | 1.331 | 0.813 | 0.626 |
| 1.712167996206449 | 1.333 | 0.817 | 0.63 |
| 1.715309588860039 | 1.336 | 0.82 | 0.634 |
| 1.71845118151363 | 1.339 | 0.823 | 0.638 |
| 1.721592774167219 | 1.342 | 0.826 | 0.641 |
| 1.724734366820809 | 1.344 | 0.83 | 0.645 |
| 1.727875959474399 | 1.347 | 0.833 | 0.649 |
| 1.731017552127988 | 1.35 | 0.836 | 0.653 |
| 1.734159144781578 | 1.353 | 0.839 | 0.657 |
| 1.737300737435168 | 1.355 | 0.843 | 0.662 |
| 1.740442330088758 | 1.358 | 0.846 | 0.666 |
| 1.743583922742348 | 1.361 | 0.849 | 0.67 |
| 1.746725515395937 | 1.363 | 0.852 | 0.674 |
| 1.749867108049527 | 1.366 | 0.856 | 0.678 |
| 1.753008700703117 | 1.369 | 0.859 | 0.682 |
| 1.756150293356707 | 1.371 | 0.862 | 0.686 |
| 1.759291886010297 | 1.374 | 0.866 | 0.69 |
| 1.762433478663887 | 1.376 | 0.869 | 0.695 |
| 1.765575071317476 | 1.379 | 0.872 | 0.699 |
| 1.768716663971066 | 1.382 | 0.875 | 0.703 |
| 1.771858256624656 | 1.384 | 0.879 | 0.707 |
| 1.774999849278246 | 1.387 | 0.882 | 0.712 |
| 1.778141441931836 | 1.389 | 0.885 | 0.716 |
| 1.781283034585426 | 1.392 | 0.888 | 0.72 |
| 1.784424627239015 | 1.395 | 0.892 | 0.725 |
| 1.787566219892605 | 1.397 | 0.895 | 0.729 |
| 1.790707812546195 | 1.4 | 0.898 | 0.733 |
| 1.793849405199785 | 1.402 | 0.902 | 0.738 |
| 1.796990997853375 | 1.405 | 0.905 | 0.742 |
| 1.800132590506964 | 1.407 | 0.908 | 0.747 |
| 1.803274183160554 | 1.41 | 0.911 | 0.751 |
| 1.806415775814144 | 1.412 | 0.915 | 0.756 |
| 1.809557368467734 | 1.415 | 0.918 | 0.76 |
| 1.812698961121324 | 1.417 | 0.921 | 0.765 |
| 1.815840553774914 | 1.42 | 0.924 | 0.769 |
| 1.818982146428503 | 1.422 | 0.928 | 0.774 |
| 1.822123739082093 | 1.424 | 0.931 | 0.778 |
| 1.825265331735683 | 1.427 | 0.934 | 0.783 |
| 1.828406924389273 | 1.429 | 0.937 | 0.788 |
| 1.831548517042863 | 1.432 | 0.941 | 0.792 |
| 1.834690109696452 | 1.434 | 0.944 | 0.797 |
| 1.837831702350042 | 1.437 | 0.947 | 0.801 |
| 1.840973295003632 | 1.439 | 0.95 | 0.806 |
| 1.844114887657222 | 1.441 | 0.954 | 0.811 |
| 1.847256480310812 | 1.444 | 0.957 | 0.816 |
| 1.850398072964402 | 1.446 | 0.96 | 0.82 |
| 1.853539665617991 | 1.448 | 0.964 | 0.825 |
| 1.856681258271581 | 1.451 | 0.967 | 0.83 |
| 1.859822850925171 | 1.453 | 0.97 | 0.835 |
| 1.862964443578761 | 1.455 | 0.973 | 0.84 |
| 1.866106036232351 | 1.458 | 0.976 | 0.845 |
| 1.86924762888594 | 1.46 | 0.98 | 0.85 |
| 1.87238922153953 | 1.462 | 0.983 | 0.854 |
| 1.87553081419312 | 1.465 | 0.986 | 0.859 |
| 1.87867240684671 | 1.467 | 0.989 | 0.864 |
| 1.8818139995003 | 1.469 | 0.993 | 0.869 |
| 1.88495559215389 | 1.471 | 0.996 | 0.874 |
| 1.888097184807479 | 1.474 | 0.999 | 0.879 |
| 1.891238777461069 | 1.476 | 1.002 | 0.884 |
| 1.89438037011466 | 1.478 | 1.006 | 0.889 |
| 1.897521962768249 | 1.48 | 1.009 | 0.895 |
| 1.900663555421839 | 1.483 | 1.012 | 0.9 |
| 1.903805148075429 | 1.485 | 1.015 | 0.905 |
| 1.906946740729018 | 1.487 | 1.018 | 0.91 |
| 1.910088333382608 | 1.489 | 1.022 | 0.915 |
| 1.913229926036198 | 1.491 | 1.025 | 0.92 |
| 1.916371518689788 | 1.493 | 1.028 | 0.926 |
| 1.919513111343378 | 1.496 | 1.031 | 0.931 |
| 1.922654703996967 | 1.498 | 1.034 | 0.936 |
| 1.925796296650557 | 1.5 | 1.038 | 0.941 |
| 1.928937889304147 | 1.502 | 1.041 | 0.947 |
| 1.932079481957737 | 1.504 | 1.044 | 0.952 |
| 1.935221074611327 | 1.506 | 1.047 | 0.957 |
| 1.938362667264917 | 1.508 | 1.05 | 0.963 |
| 1.941504259918506 | 1.51 | 1.054 | 0.968 |
| 1.944645852572096 | 1.512 | 1.057 | 0.974 |
| 1.947787445225686 | 1.515 | 1.06 | 0.979 |
| 1.950929037879276 | 1.517 | 1.063 | 0.984 |
| 1.954070630532866 | 1.519 | 1.066 | 0.99 |
| 1.957212223186455 | 1.521 | 1.069 | 0.995 |
| 1.960353815840045 | 1.523 | 1.073 | 1.001 |
| 1.963495408493635 | 1.525 | 1.076 | 1.007 |
| 1.966637001147225 | 1.527 | 1.079 | 1.012 |
| 1.969778593800815 | 1.529 | 1.082 | 1.018 |
| 1.972920186454405 | 1.531 | 1.085 | 1.023 |
| 1.976061779107994 | 1.533 | 1.088 | 1.029 |
| 1.979203371761584 | 1.535 | 1.091 | 1.035 |
| 1.982344964415174 | 1.537 | 1.094 | 1.04 |
| 1.985486557068764 | 1.539 | 1.098 | 1.046 |
| 1.988628149722354 | 1.541 | 1.101 | 1.052 |
| 1.991769742375943 | 1.542 | 1.104 | 1.058 |
| 1.994911335029533 | 1.544 | 1.107 | 1.063 |
| 1.998052927683123 | 1.546 | 1.11 | 1.069 |
| 2.001194520336712 | 1.548 | 1.113 | 1.075 |
| 2.004336112990302 | 1.55 | 1.116 | 1.081 |
| 2.007477705643892 | 1.552 | 1.119 | 1.087 |
| 2.010619298297482 | 1.554 | 1.122 | 1.093 |
| 2.013760890951071 | 1.556 | 1.125 | 1.099 |
| 2.016902483604661 | 1.558 | 1.128 | 1.105 |
| 2.02004407625825 | 1.56 | 1.132 | 1.111 |
| 2.02318566891184 | 1.561 | 1.135 | 1.117 |
| 2.02632726156543 | 1.563 | 1.138 | 1.123 |
| 2.029468854219019 | 1.565 | 1.141 | 1.129 |
| 2.032610446872609 | 1.567 | 1.144 | 1.135 |
| 2.035752039526198 | 1.569 | 1.147 | 1.141 |
| 2.038893632179788 | 1.57 | 1.15 | 1.147 |
| 2.042035224833378 | 1.572 | 1.153 | 1.153 |
| 2.045176817486967 | 1.574 | 1.156 | 1.159 |
| 2.048318410140557 | 1.576 | 1.159 | 1.165 |
| 2.051460002794146 | 1.578 | 1.162 | 1.172 |
| 2.054601595447736 | 1.579 | 1.165 | 1.178 |
| 2.057743188101325 | 1.581 | 1.168 | 1.184 |
| 2.060884780754915 | 1.583 | 1.171 | 1.19 |
| 2.064026373408505 | 1.585 | 1.174 | 1.197 |
| 2.067167966062094 | 1.586 | 1.177 | 1.203 |
| 2.070309558715684 | 1.588 | 1.18 | 1.209 |
| 2.073451151369273 | 1.59 | 1.183 | 1.216 |
| 2.076592744022863 | 1.591 | 1.186 | 1.222 |
| 2.079734336676452 | 1.593 | 1.189 | 1.229 |
| 2.082875929330042 | 1.595 | 1.191 | 1.235 |
| 2.086017521983632 | 1.596 | 1.194 | 1.241 |
| 2.089159114637221 | 1.598 | 1.197 | 1.248 |
| 2.092300707290811 | 1.6 | 1.2 | 1.254 |
| 2.095442299944401 | 1.601 | 1.203 | 1.261 |
| 2.09858389259799 | 1.603 | 1.206 | 1.268 |
| 2.10172548525158 | 1.605 | 1.209 | 1.274 |
| 2.104867077905169 | 1.606 | 1.212 | 1.281 |
| 2.108008670558759 | 1.608 | 1.215 | 1.287 |
| 2.111150263212349 | 1.609 | 1.218 | 1.294 |
| 2.114291855865938 | 1.611 | 1.22 | 1.301 |
| 2.117433448519528 | 1.613 | 1.223 | 1.307 |
| 2.120575041173117 | 1.614 | 1.226 | 1.314 |
| 2.123716633826707 | 1.616 | 1.229 | 1.321 |
| 2.126858226480297 | 1.617 | 1.232 | 1.328 |
| 2.129999819133886 | 1.619 | 1.235 | 1.335 |
| 2.133141411787476 | 1.62 | 1.237 | 1.341 |
| 2.136283004441065 | 1.622 | 1.24 | 1.348 |
| 2.139424597094655 | 1.623 | 1.243 | 1.355 |
| 2.142566189748245 | 1.625 | 1.246 | 1.362 |
| 2.145707782401834 | 1.626 | 1.249 | 1.369 |
| 2.148849375055424 | 1.628 | 1.251 | 1.376 |
| 2.151990967709013 | 1.629 | 1.254 | 1.383 |
| 2.155132560362603 | 1.631 | 1.257 | 1.39 |
| 2.158274153016193 | 1.632 | 1.26 | 1.397 |
| 2.161415745669782 | 1.634 | 1.263 | 1.404 |
| 2.164557338323372 | 1.635 | 1.265 | 1.411 |
| 2.167698930976961 | 1.637 | 1.268 | 1.418 |
| 2.170840523630551 | 1.638 | 1.271 | 1.425 |
| 2.173982116284141 | 1.639 | 1.273 | 1.432 |
| 2.17712370893773 | 1.641 | 1.276 | 1.439 |
| 2.18026530159132 | 1.642 | 1.279 | 1.447 |
| 2.183406894244909 | 1.644 | 1.282 | 1.454 |
| 2.186548486898499 | 1.645 | 1.284 | 1.461 |
| 2.189690079552089 | 1.646 | 1.287 | 1.468 |
| 2.192831672205678 | 1.648 | 1.29 | 1.475 |
| 2.195973264859268 | 1.649 | 1.292 | 1.483 |
| 2.199114857512857 | 1.65 | 1.295 | 1.49 |
| 2.202256450166447 | 1.652 | 1.297 | 1.497 |
| 2.205398042820036 | 1.653 | 1.3 | 1.505 |
| 2.208539635473626 | 1.654 | 1.303 | 1.512 |
| 2.211681228127216 | 1.656 | 1.305 | 1.52 |
| 2.214822820780805 | 1.657 | 1.308 | 1.527 |
| 2.217964413434395 | 1.658 | 1.311 | 1.534 |
| 2.221106006087984 | 1.66 | 1.313 | 1.542 |
| 2.224247598741574 | 1.661 | 1.316 | 1.549 |
| 2.227389191395164 | 1.662 | 1.318 | 1.557 |
| 2.230530784048753 | 1.664 | 1.321 | 1.564 |
| 2.233672376702343 | 1.665 | 1.323 | 1.572 |
| 2.236813969355933 | 1.666 | 1.326 | 1.58 |
| 2.239955562009522 | 1.667 | 1.328 | 1.587 |
| 2.243097154663112 | 1.668 | 1.331 | 1.595 |
| 2.246238747316701 | 1.67 | 1.333 | 1.602 |
| 2.249380339970291 | 1.671 | 1.336 | 1.61 |
| 2.252521932623881 | 1.672 | 1.338 | 1.618 |
| 2.25566352527747 | 1.673 | 1.341 | 1.626 |
| 2.25880511793106 | 1.675 | 1.343 | 1.633 |
| 2.261946710584649 | 1.676 | 1.346 | 1.641 |
| 2.265088303238239 | 1.677 | 1.348 | 1.649 |
| 2.268229895891829 | 1.678 | 1.351 | 1.657 |
| 2.271371488545418 | 1.679 | 1.353 | 1.664 |
| 2.274513081199008 | 1.68 | 1.356 | 1.672 |
| 2.277654673852597 | 1.682 | 1.358 | 1.68 |
| 2.280796266506186 | 1.683 | 1.36 | 1.688 |
| 2.283937859159776 | 1.684 | 1.363 | 1.696 |
| 2.287079451813366 | 1.685 | 1.365 | 1.704 |
| 2.290221044466955 | 1.686 | 1.367 | 1.712 |
| 2.293362637120545 | 1.687 | 1.37 | 1.72 |
| 2.296504229774135 | 1.688 | 1.372 | 1.728 |
| 2.299645822427724 | 1.689 | 1.374 | 1.736 |
| 2.302787415081314 | 1.69 | 1.377 | 1.744 |
| 2.305929007734904 | 1.692 | 1.379 | 1.752 |
| 2.309070600388493 | 1.693 | 1.381 | 1.76 |
| 2.312212193042083 | 1.694 | 1.384 | 1.768 |
| 2.315353785695672 | 1.695 | 1.386 | 1.776 |
| 2.318495378349262 | 1.696 | 1.388 | 1.784 |
| 2.321636971002852 | 1.697 | 1.39 | 1.792 |
| 2.324778563656441 | 1.698 | 1.393 | 1.8 |
| 2.327920156310031 | 1.699 | 1.395 | 1.809 |
| 2.33106174896362 | 1.7 | 1.397 | 1.817 |
| 2.33420334161721 | 1.701 | 1.399 | 1.825 |
| 2.3373449342708 | 1.702 | 1.402 | 1.833 |
| 2.340486526924389 | 1.703 | 1.404 | 1.841 |
| 2.343628119577979 | 1.704 | 1.406 | 1.85 |
| 2.346769712231568 | 1.705 | 1.408 | 1.858 |
| 2.349911304885158 | 1.706 | 1.41 | 1.866 |
| 2.353052897538748 | 1.707 | 1.412 | 1.875 |
| 2.356194490192337 | 1.708 | 1.415 | 1.883 |
| 2.359336082845927 | 1.709 | 1.417 | 1.891 |
| 2.362477675499516 | 1.71 | 1.419 | 1.9 |
| 2.365619268153106 | 1.711 | 1.421 | 1.908 |
| 2.368760860806696 | 1.712 | 1.423 | 1.916 |
| 2.371902453460285 | 1.712 | 1.425 | 1.925 |
| 2.375044046113875 | 1.713 | 1.427 | 1.933 |
| 2.378185638767464 | 1.714 | 1.429 | 1.942 |
| 2.381327231421054 | 1.715 | 1.431 | 1.95 |
| 2.384468824074644 | 1.716 | 1.433 | 1.958 |
| 2.387610416728233 | 1.717 | 1.435 | 1.967 |
| 2.390752009381823 | 1.718 | 1.437 | 1.975 |
| 2.393893602035412 | 1.719 | 1.439 | 1.984 |
| 2.397035194689002 | 1.72 | 1.441 | 1.992 |
| 2.400176787342591 | 1.72 | 1.443 | 2.001 |
| 2.403318379996181 | 1.721 | 1.445 | 2.009 |
| 2.406459972649771 | 1.722 | 1.447 | 2.018 |
| 2.40960156530336 | 1.723 | 1.449 | 2.027 |
| 2.41274315795695 | 1.724 | 1.451 | 2.035 |
| 2.41588475061054 | 1.725 | 1.453 | 2.044 |
| 2.419026343264129 | 1.725 | 1.455 | 2.052 |
| 2.422167935917719 | 1.726 | 1.457 | 2.061 |
| 2.425309528571308 | 1.727 | 1.459 | 2.069 |
| 2.428451121224898 | 1.728 | 1.461 | 2.078 |
| 2.431592713878488 | 1.729 | 1.462 | 2.087 |
| 2.434734306532077 | 1.729 | 1.464 | 2.095 |
| 2.437875899185667 | 1.73 | 1.466 | 2.104 |
| 2.441017491839256 | 1.731 | 1.468 | 2.113 |
| 2.444159084492846 | 1.732 | 1.47 | 2.121 |
| 2.447300677146435 | 1.732 | 1.472 | 2.13 |
| 2.450442269800025 | 1.733 | 1.473 | 2.139 |
| 2.453583862453615 | 1.734 | 1.475 | 2.147 |
| 2.456725455107204 | 1.735 | 1.477 | 2.156 |
| 2.459867047760794 | 1.735 | 1.479 | 2.165 |
| 2.463008640414384 | 1.736 | 1.48 | 2.173 |
| 2.466150233067973 | 1.737 | 1.482 | 2.182 |
| 2.469291825721563 | 1.738 | 1.484 | 2.191 |
| 2.472433418375152 | 1.738 | 1.486 | 2.199 |
| 2.475575011028742 | 1.739 | 1.487 | 2.208 |
| 2.478716603682332 | 1.74 | 1.489 | 2.217 |
| 2.481858196335921 | 1.74 | 1.491 | 2.226 |
| 2.48499978898951 | 1.741 | 1.492 | 2.234 |
| 2.4881413816431 | 1.742 | 1.494 | 2.243 |
| 2.49128297429669 | 1.742 | 1.496 | 2.252 |
| 2.49442456695028 | 1.743 | 1.497 | 2.26 |
| 2.497566159603869 | 1.744 | 1.499 | 2.269 |
| 2.500707752257458 | 1.744 | 1.5 | 2.278 |
| 2.503849344911048 | 1.745 | 1.502 | 2.287 |
| 2.506990937564638 | 1.746 | 1.504 | 2.295 |
| 2.510132530218228 | 1.746 | 1.505 | 2.304 |
| 2.513274122871817 | 1.747 | 1.507 | 2.313 |
| 2.516415715525407 | 1.747 | 1.508 | 2.322 |
| 2.519557308178996 | 1.748 | 1.51 | 2.33 |
| 2.522698900832586 | 1.749 | 1.511 | 2.339 |
| 2.525840493486176 | 1.749 | 1.513 | 2.348 |
| 2.528982086139765 | 1.75 | 1.514 | 2.356 |
| 2.532123678793355 | 1.75 | 1.516 | 2.365 |
| 2.535265271446944 | 1.751 | 1.517 | 2.374 |
| 2.538406864100534 | 1.752 | 1.519 | 2.382 |
| 2.541548456754124 | 1.752 | 1.52 | 2.391 |
| 2.544690049407713 | 1.753 | 1.521 | 2.4 |
| 2.547831642061302 | 1.753 | 1.523 | 2.409 |
| 2.550973234714892 | 1.754 | 1.524 | 2.417 |
| 2.554114827368482 | 1.754 | 1.526 | 2.426 |
| 2.557256420022072 | 1.755 | 1.527 | 2.434 |
| 2.560398012675661 | 1.755 | 1.528 | 2.443 |
| 2.563539605329251 | 1.756 | 1.53 | 2.452 |
| 2.56668119798284 | 1.757 | 1.531 | 2.46 |
| 2.56982279063643 | 1.757 | 1.533 | 2.469 |
| 2.57296438329002 | 1.758 | 1.534 | 2.478 |
| 2.576105975943609 | 1.758 | 1.535 | 2.486 |
| 2.579247568597199 | 1.759 | 1.536 | 2.495 |
| 2.582389161250788 | 1.759 | 1.538 | 2.503 |
| 2.585530753904377 | 1.76 | 1.539 | 2.512 |
| 2.588672346557967 | 1.76 | 1.54 | 2.52 |
| 2.591813939211557 | 1.761 | 1.542 | 2.529 |
| 2.594955531865147 | 1.761 | 1.543 | 2.537 |
| 2.598097124518736 | 1.761 | 1.544 | 2.546 |
| 2.601238717172326 | 1.762 | 1.545 | 2.554 |
| 2.604380309825915 | 1.762 | 1.546 | 2.563 |
| 2.607521902479505 | 1.763 | 1.548 | 2.571 |
| 2.610663495133095 | 1.763 | 1.549 | 2.579 |
| 2.613805087786684 | 1.764 | 1.55 | 2.588 |
| 2.616946680440274 | 1.764 | 1.551 | 2.596 |
| 2.620088273093863 | 1.765 | 1.552 | 2.604 |
| 2.623229865747452 | 1.765 | 1.553 | 2.613 |
| 2.626371458401042 | 1.765 | 1.555 | 2.621 |
| 2.629513051054632 | 1.766 | 1.556 | 2.629 |
| 2.632654643708222 | 1.766 | 1.557 | 2.637 |
| 2.635796236361811 | 1.767 | 1.558 | 2.646 |
| 2.638937829015401 | 1.767 | 1.559 | 2.654 |
| 2.642079421668991 | 1.767 | 1.56 | 2.662 |
| 2.64522101432258 | 1.768 | 1.561 | 2.67 |
| 2.64836260697617 | 1.768 | 1.562 | 2.678 |
| 2.651504199629759 | 1.769 | 1.563 | 2.686 |
| 2.654645792283349 | 1.769 | 1.564 | 2.694 |
| 2.657787384936938 | 1.769 | 1.565 | 2.702 |
| 2.660928977590528 | 1.77 | 1.566 | 2.71 |
| 2.664070570244118 | 1.77 | 1.567 | 2.718 |
| 2.667212162897707 | 1.771 | 1.568 | 2.726 |
| 2.670353755551297 | 1.771 | 1.569 | 2.734 |
| 2.673495348204887 | 1.771 | 1.57 | 2.742 |
| 2.676636940858476 | 1.772 | 1.571 | 2.749 |
| 2.679778533512066 | 1.772 | 1.572 | 2.757 |
| 2.682920126165655 | 1.772 | 1.573 | 2.765 |
| 2.686061718819245 | 1.773 | 1.574 | 2.773 |
| 2.689203311472835 | 1.773 | 1.575 | 2.78 |
| 2.692344904126424 | 1.773 | 1.576 | 2.788 |
| 2.695486496780014 | 1.774 | 1.576 | 2.795 |
| 2.698628089433603 | 1.774 | 1.577 | 2.803 |
| 2.701769682087193 | 1.774 | 1.578 | 2.811 |
| 2.704911274740782 | 1.774 | 1.579 | 2.818 |
| 2.708052867394372 | 1.775 | 1.58 | 2.825 |
| 2.711194460047962 | 1.775 | 1.581 | 2.833 |
| 2.714336052701551 | 1.775 | 1.581 | 2.84 |
| 2.717477645355141 | 1.776 | 1.582 | 2.847 |
| 2.720619238008731 | 1.776 | 1.583 | 2.855 |
| 2.72376083066232 | 1.776 | 1.584 | 2.862 |
| 2.72690242331591 | 1.776 | 1.585 | 2.869 |
| 2.730044015969499 | 1.777 | 1.585 | 2.876 |
| 2.733185608623089 | 1.777 | 1.586 | 2.883 |
| 2.736327201276678 | 1.777 | 1.587 | 2.89 |
| 2.739468793930268 | 1.778 | 1.588 | 2.897 |
| 2.742610386583858 | 1.778 | 1.588 | 2.904 |
| 2.745751979237447 | 1.778 | 1.589 | 2.911 |
| 2.748893571891036 | 1.778 | 1.59 | 2.917 |
| 2.752035164544627 | 1.779 | 1.59 | 2.924 |
| 2.755176757198216 | 1.779 | 1.591 | 2.931 |
| 2.758318349851806 | 1.779 | 1.592 | 2.937 |
| 2.761459942505395 | 1.779 | 1.592 | 2.944 |
| 2.764601535158985 | 1.779 | 1.593 | 2.951 |
| 2.767743127812574 | 1.78 | 1.594 | 2.957 |
| 2.770884720466164 | 1.78 | 1.594 | 2.963 |
| 2.774026313119754 | 1.78 | 1.595 | 2.97 |
| 2.777167905773343 | 1.78 | 1.595 | 2.976 |
| 2.780309498426932 | 1.781 | 1.596 | 2.982 |
| 2.783451091080522 | 1.781 | 1.597 | 2.988 |
| 2.786592683734112 | 1.781 | 1.597 | 2.995 |
| 2.789734276387701 | 1.781 | 1.598 | 3.001 |
| 2.792875869041291 | 1.781 | 1.598 | 3.007 |
| 2.796017461694881 | 1.782 | 1.599 | 3.012 |
| 2.79915905434847 | 1.782 | 1.599 | 3.018 |
| 2.80230064700206 | 1.782 | 1.6 | 3.024 |
| 2.80544223965565 | 1.782 | 1.601 | 3.03 |
| 2.808583832309239 | 1.782 | 1.601 | 3.036 |
| 2.811725424962829 | 1.782 | 1.602 | 3.041 |
| 2.814867017616419 | 1.783 | 1.602 | 3.047 |
| 2.818008610270008 | 1.783 | 1.603 | 3.052 |
| 2.821150202923598 | 1.783 | 1.603 | 3.058 |
| 2.824291795577187 | 1.783 | 1.603 | 3.063 |
| 2.827433388230777 | 1.783 | 1.604 | 3.068 |
| 2.830574980884366 | 1.783 | 1.604 | 3.073 |
| 2.833716573537956 | 1.784 | 1.605 | 3.079 |
| 2.836858166191546 | 1.784 | 1.605 | 3.084 |
| 2.839999758845135 | 1.784 | 1.606 | 3.089 |
| 2.843141351498725 | 1.784 | 1.606 | 3.094 |
| 2.846282944152314 | 1.784 | 1.607 | 3.098 |
| 2.849424536805904 | 1.784 | 1.607 | 3.103 |
| 2.852566129459494 | 1.784 | 1.607 | 3.108 |
| 2.855707722113083 | 1.785 | 1.608 | 3.113 |
| 2.858849314766673 | 1.785 | 1.608 | 3.117 |
| 2.861990907420262 | 1.785 | 1.608 | 3.122 |
| 2.865132500073852 | 1.785 | 1.609 | 3.126 |
| 2.868274092727442 | 1.785 | 1.609 | 3.131 |
| 2.871415685381031 | 1.785 | 1.61 | 3.135 |
| 2.874557278034621 | 1.785 | 1.61 | 3.139 |
| 2.87769887068821 | 1.785 | 1.61 | 3.143 |
| 2.8808404633418 | 1.786 | 1.611 | 3.147 |
| 2.88398205599539 | 1.786 | 1.611 | 3.151 |
| 2.88712364864898 | 1.786 | 1.611 | 3.155 |
| 2.890265241302569 | 1.786 | 1.611 | 3.159 |
| 2.893406833956158 | 1.786 | 1.612 | 3.163 |
| 2.896548426609748 | 1.786 | 1.612 | 3.167 |
| 2.899690019263338 | 1.786 | 1.612 | 3.17 |
| 2.902831611916927 | 1.786 | 1.613 | 3.174 |
| 2.905973204570517 | 1.786 | 1.613 | 3.177 |
| 2.909114797224106 | 1.786 | 1.613 | 3.181 |
| 2.912256389877696 | 1.786 | 1.613 | 3.184 |
| 2.915397982531286 | 1.787 | 1.614 | 3.188 |
| 2.918539575184875 | 1.787 | 1.614 | 3.191 |
| 2.921681167838465 | 1.787 | 1.614 | 3.194 |
| 2.924822760492054 | 1.787 | 1.614 | 3.197 |
| 2.927964353145644 | 1.787 | 1.615 | 3.2 |
| 2.931105945799234 | 1.787 | 1.615 | 3.203 |
| 2.934247538452823 | 1.787 | 1.615 | 3.206 |
| 2.937389131106413 | 1.787 | 1.615 | 3.209 |
| 2.940530723760002 | 1.787 | 1.615 | 3.211 |
| 2.943672316413592 | 1.787 | 1.616 | 3.214 |
| 2.946813909067182 | 1.787 | 1.616 | 3.217 |
| 2.949955501720771 | 1.787 | 1.616 | 3.219 |
| 2.953097094374361 | 1.787 | 1.616 | 3.221 |
| 2.95623868702795 | 1.787 | 1.616 | 3.224 |
| 2.95938027968154 | 1.788 | 1.616 | 3.226 |
| 2.96252187233513 | 1.788 | 1.617 | 3.228 |
| 2.965663464988719 | 1.788 | 1.617 | 3.231 |
| 2.968805057642309 | 1.788 | 1.617 | 3.233 |
| 2.971946650295898 | 1.788 | 1.617 | 3.235 |
| 2.975088242949488 | 1.788 | 1.617 | 3.237 |
| 2.978229835603078 | 1.788 | 1.617 | 3.239 |
| 2.981371428256667 | 1.788 | 1.617 | 3.24 |
| 2.984513020910257 | 1.788 | 1.618 | 3.242 |
| 2.987654613563846 | 1.788 | 1.618 | 3.244 |
| 2.990796206217436 | 1.788 | 1.618 | 3.246 |
| 2.993937798871025 | 1.788 | 1.618 | 3.247 |
| 2.997079391524615 | 1.788 | 1.618 | 3.249 |
| 3.000220984178205 | 1.788 | 1.618 | 3.25 |
| 3.003362576831794 | 1.788 | 1.618 | 3.252 |
| 3.006504169485384 | 1.788 | 1.618 | 3.253 |
| 3.009645762138974 | 1.788 | 1.618 | 3.254 |
| 3.012787354792563 | 1.788 | 1.618 | 3.255 |
| 3.015928947446153 | 1.788 | 1.619 | 3.257 |
| 3.019070540099742 | 1.788 | 1.619 | 3.258 |
| 3.022212132753332 | 1.788 | 1.619 | 3.259 |
| 3.025353725406922 | 1.788 | 1.619 | 3.26 |
| 3.028495318060511 | 1.788 | 1.619 | 3.261 |
| 3.031636910714101 | 1.788 | 1.619 | 3.262 |
| 3.03477850336769 | 1.788 | 1.619 | 3.263 |
| 3.03792009602128 | 1.788 | 1.619 | 3.263 |
| 3.04106168867487 | 1.788 | 1.619 | 3.264 |
| 3.04420328132846 | 1.788 | 1.619 | 3.265 |
| 3.047344873982049 | 1.788 | 1.619 | 3.266 |
| 3.050486466635638 | 1.788 | 1.619 | 3.266 |
| 3.053628059289228 | 1.788 | 1.619 | 3.267 |
| 3.056769651942818 | 1.788 | 1.619 | 3.268 |
| 3.059911244596407 | 1.788 | 1.619 | 3.268 |
| 3.063052837249997 | 1.788 | 1.619 | 3.269 |
| 3.066194429903586 | 1.788 | 1.619 | 3.269 |
| 3.069336022557176 | 1.788 | 1.619 | 3.269 |
| 3.072477615210766 | 1.788 | 1.619 | 3.27 |
| 3.075619207864355 | 1.788 | 1.619 | 3.27 |
| 3.078760800517945 | 1.788 | 1.619 | 3.27 |
| 3.081902393171534 | 1.789 | 1.619 | 3.271 |
| 3.085043985825124 | 1.789 | 1.619 | 3.271 |
| 3.088185578478713 | 1.789 | 1.619 | 3.271 |
| 3.091327171132303 | 1.789 | 1.619 | 3.271 |
| 3.094468763785893 | 1.789 | 1.619 | 3.272 |
| 3.097610356439482 | 1.789 | 1.62 | 3.272 |
| 3.100751949093072 | 1.789 | 1.62 | 3.272 |
| 3.103893541746661 | 1.789 | 1.62 | 3.272 |
| 3.107035134400251 | 1.789 | 1.62 | 3.272 |
| 3.110176727053841 | 1.789 | 1.62 | 3.272 |
| 3.11331831970743 | 1.789 | 1.62 | 3.272 |
| 3.11645991236102 | 1.789 | 1.62 | 3.272 |
| 3.11960150501461 | 1.789 | 1.62 | 3.272 |
| 3.122743097668199 | 1.789 | 1.62 | 3.272 |
| 3.125884690321789 | 1.789 | 1.62 | 3.272 |
| 3.129026282975378 | 1.789 | 1.62 | 3.272 |
| 3.132167875628968 | 1.789 | 1.62 | 3.272 |
| 3.135309468282557 | 1.789 | 1.62 | 3.272 |
| 3.138451060936147 | 1.789 | 1.62 | 3.272 |
| 3.141592653589737 | 1.789 | 1.62 | 3.272 |
| 3.144734246243326 | 1.789 | 1.62 | 3.272 |
| 3.147875838896916 | 1.789 | 1.62 | 3.272 |
| 3.151017431550505 | 1.789 | 1.62 | 3.272 |
| 3.154159024204095 | 1.789 | 1.62 | 3.273 |
| 3.157300616857685 | 1.789 | 1.62 | 3.273 |
| 3.160442209511274 | 1.789 | 1.62 | 3.273 |
| 3.163583802164864 | 1.789 | 1.62 | 3.273 |
| 3.166725394818453 | 1.789 | 1.62 | 3.273 |
| 3.169866987472043 | 1.789 | 1.62 | 3.273 |
| 3.173008580125633 | 1.789 | 1.62 | 3.273 |
| 3.176150172779222 | 1.789 | 1.62 | 3.273 |
| 3.179291765432812 | 1.789 | 1.62 | 3.273 |
| 3.182433358086401 | 1.789 | 1.62 | 3.273 |
| 3.185574950739991 | 1.789 | 1.62 | 3.273 |
| 3.188716543393581 | 1.789 | 1.62 | 3.273 |
| 3.19185813604717 | 1.789 | 1.62 | 3.274 |
| 3.19499972870076 | 1.789 | 1.62 | 3.274 |
| 3.198141321354349 | 1.789 | 1.62 | 3.274 |
| 3.20128291400794 | 1.789 | 1.62 | 3.274 |
| 3.204424506661528 | 1.789 | 1.62 | 3.275 |
| 3.207566099315118 | 1.789 | 1.62 | 3.275 |
| 3.210707691968708 | 1.789 | 1.62 | 3.275 |
| 3.213849284622297 | 1.789 | 1.62 | 3.276 |
| 3.216990877275887 | 1.789 | 1.62 | 3.276 |
| 3.220132469929476 | 1.789 | 1.62 | 3.276 |
| 3.223274062583066 | 1.789 | 1.62 | 3.277 |
| 3.226415655236656 | 1.789 | 1.62 | 3.277 |
| 3.229557247890245 | 1.789 | 1.62 | 3.278 |
| 3.232698840543835 | 1.789 | 1.62 | 3.279 |
| 3.235840433197425 | 1.789 | 1.62 | 3.279 |
| 3.238982025851014 | 1.789 | 1.62 | 3.28 |
| 3.242123618504604 | 1.789 | 1.62 | 3.281 |
| 3.245265211158193 | 1.789 | 1.62 | 3.282 |
| 3.248406803811783 | 1.789 | 1.62 | 3.282 |
| 3.251548396465373 | 1.789 | 1.62 | 3.283 |
| 3.254689989118962 | 1.789 | 1.62 | 3.284 |
| 3.257831581772551 | 1.789 | 1.62 | 3.285 |
| 3.260973174426141 | 1.789 | 1.62 | 3.286 |
| 3.26411476707973 | 1.789 | 1.621 | 3.287 |
| 3.267256359733321 | 1.789 | 1.621 | 3.288 |
| 3.27039795238691 | 1.789 | 1.621 | 3.29 |
| 3.2735395450405 | 1.789 | 1.621 | 3.291 |
| 3.276681137694089 | 1.789 | 1.621 | 3.292 |
| 3.279822730347679 | 1.789 | 1.621 | 3.293 |
| 3.282964323001269 | 1.789 | 1.621 | 3.295 |
| 3.286105915654858 | 1.789 | 1.621 | 3.296 |
| 3.289247508308448 | 1.789 | 1.621 | 3.298 |
| 3.292389100962037 | 1.789 | 1.621 | 3.299 |
| 3.295530693615627 | 1.789 | 1.621 | 3.301 |
| 3.298672286269217 | 1.789 | 1.622 | 3.303 |
| 3.301813878922806 | 1.789 | 1.622 | 3.305 |
| 3.304955471576396 | 1.789 | 1.622 | 3.306 |
| 3.308097064229985 | 1.789 | 1.622 | 3.308 |
| 3.311238656883575 | 1.789 | 1.622 | 3.31 |
| 3.314380249537165 | 1.789 | 1.622 | 3.312 |
| 3.317521842190754 | 1.789 | 1.622 | 3.314 |
| 3.320663434844344 | 1.79 | 1.623 | 3.317 |
| 3.323805027497933 | 1.79 | 1.623 | 3.319 |
| 3.326946620151523 | 1.79 | 1.623 | 3.321 |
| 3.330088212805113 | 1.79 | 1.623 | 3.324 |
| 3.333229805458702 | 1.79 | 1.623 | 3.326 |
| 3.336371398112292 | 1.79 | 1.623 | 3.328 |
| 3.339512990765881 | 1.79 | 1.624 | 3.331 |
| 3.342654583419471 | 1.79 | 1.624 | 3.334 |
| 3.345796176073061 | 1.79 | 1.624 | 3.336 |
| 3.34893776872665 | 1.79 | 1.624 | 3.339 |
| 3.35207936138024 | 1.79 | 1.624 | 3.342 |
| 3.355220954033829 | 1.79 | 1.625 | 3.345 |
| 3.358362546687419 | 1.79 | 1.625 | 3.348 |
| 3.361504139341009 | 1.79 | 1.625 | 3.351 |
| 3.364645731994598 | 1.79 | 1.625 | 3.354 |
| 3.367787324648188 | 1.791 | 1.625 | 3.357 |
| 3.370928917301777 | 1.791 | 1.626 | 3.361 |
| 3.374070509955367 | 1.791 | 1.626 | 3.364 |
| 3.377212102608956 | 1.791 | 1.626 | 3.368 |
| 3.380353695262546 | 1.791 | 1.626 | 3.371 |
| 3.383495287916136 | 1.791 | 1.627 | 3.375 |
| 3.386636880569725 | 1.791 | 1.627 | 3.378 |
| 3.389778473223315 | 1.791 | 1.627 | 3.382 |
| 3.392920065876904 | 1.791 | 1.628 | 3.386 |
| 3.396061658530494 | 1.791 | 1.628 | 3.39 |
| 3.399203251184084 | 1.791 | 1.628 | 3.394 |
| 3.402344843837673 | 1.792 | 1.629 | 3.398 |
| 3.405486436491263 | 1.792 | 1.629 | 3.402 |
| 3.408628029144852 | 1.792 | 1.629 | 3.406 |
| 3.411769621798442 | 1.792 | 1.63 | 3.41 |
| 3.414911214452032 | 1.792 | 1.63 | 3.414 |
| 3.418052807105621 | 1.792 | 1.63 | 3.419 |
| 3.421194399759211 | 1.792 | 1.631 | 3.423 |
| 3.4243359924128 | 1.792 | 1.631 | 3.428 |
| 3.42747758506639 | 1.793 | 1.631 | 3.432 |
| 3.43061917771998 | 1.793 | 1.632 | 3.437 |
| 3.433760770373569 | 1.793 | 1.632 | 3.442 |
| 3.436902363027159 | 1.793 | 1.633 | 3.447 |
| 3.440043955680748 | 1.793 | 1.633 | 3.451 |
| 3.443185548334338 | 1.793 | 1.633 | 3.456 |
| 3.446327140987927 | 1.793 | 1.634 | 3.461 |
| 3.449468733641517 | 1.793 | 1.634 | 3.466 |
| 3.452610326295107 | 1.794 | 1.635 | 3.472 |
| 3.455751918948696 | 1.794 | 1.635 | 3.477 |
| 3.458893511602286 | 1.794 | 1.636 | 3.482 |
| 3.462035104255876 | 1.794 | 1.636 | 3.487 |
| 3.465176696909465 | 1.794 | 1.637 | 3.493 |
| 3.468318289563055 | 1.794 | 1.637 | 3.498 |
| 3.471459882216644 | 1.795 | 1.638 | 3.504 |
| 3.474601474870234 | 1.795 | 1.638 | 3.509 |
| 3.477743067523824 | 1.795 | 1.639 | 3.515 |
| 3.480884660177413 | 1.795 | 1.639 | 3.521 |
| 3.484026252831002 | 1.795 | 1.64 | 3.527 |
| 3.487167845484592 | 1.796 | 1.64 | 3.532 |
| 3.490309438138182 | 1.796 | 1.641 | 3.538 |
| 3.493451030791772 | 1.796 | 1.641 | 3.544 |
| 3.496592623445361 | 1.796 | 1.642 | 3.55 |
| 3.499734216098951 | 1.796 | 1.642 | 3.557 |
| 3.50287580875254 | 1.797 | 1.643 | 3.563 |
| 3.50601740140613 | 1.797 | 1.644 | 3.569 |
| 3.50915899405972 | 1.797 | 1.644 | 3.575 |
| 3.512300586713309 | 1.797 | 1.645 | 3.582 |
| 3.515442179366899 | 1.797 | 1.645 | 3.588 |
| 3.518583772020488 | 1.798 | 1.646 | 3.594 |
| 3.521725364674078 | 1.798 | 1.647 | 3.601 |
| 3.524866957327668 | 1.798 | 1.647 | 3.608 |
| 3.528008549981257 | 1.798 | 1.648 | 3.614 |
| 3.531150142634847 | 1.799 | 1.649 | 3.621 |
| 3.534291735288436 | 1.799 | 1.649 | 3.628 |
| 3.537433327942026 | 1.799 | 1.65 | 3.634 |
| 3.540574920595616 | 1.799 | 1.651 | 3.641 |
| 3.543716513249205 | 1.8 | 1.652 | 3.648 |
| 3.546858105902795 | 1.8 | 1.652 | 3.655 |
| 3.549999698556384 | 1.8 | 1.653 | 3.662 |
| 3.553141291209974 | 1.8 | 1.654 | 3.669 |
| 3.556282883863564 | 1.801 | 1.655 | 3.676 |
| 3.559424476517153 | 1.801 | 1.655 | 3.683 |
| 3.562566069170743 | 1.801 | 1.656 | 3.69 |
| 3.565707661824332 | 1.801 | 1.657 | 3.698 |
| 3.568849254477922 | 1.802 | 1.658 | 3.705 |
| 3.571990847131511 | 1.802 | 1.658 | 3.712 |
| 3.575132439785101 | 1.802 | 1.659 | 3.72 |
| 3.578274032438691 | 1.803 | 1.66 | 3.727 |
| 3.58141562509228 | 1.803 | 1.661 | 3.734 |
| 3.58455721774587 | 1.803 | 1.662 | 3.742 |
| 3.58769881039946 | 1.804 | 1.663 | 3.75 |
| 3.590840403053049 | 1.804 | 1.664 | 3.757 |
| 3.593981995706639 | 1.804 | 1.664 | 3.765 |
| 3.597123588360228 | 1.805 | 1.665 | 3.772 |
| 3.600265181013818 | 1.805 | 1.666 | 3.78 |
| 3.603406773667407 | 1.805 | 1.667 | 3.788 |
| 3.606548366320997 | 1.806 | 1.668 | 3.796 |
| 3.609689958974587 | 1.806 | 1.669 | 3.803 |
| 3.612831551628176 | 1.806 | 1.67 | 3.811 |
| 3.615973144281766 | 1.807 | 1.671 | 3.819 |
| 3.619114736935355 | 1.807 | 1.672 | 3.827 |
| 3.622256329588945 | 1.807 | 1.673 | 3.835 |
| 3.625397922242534 | 1.808 | 1.674 | 3.843 |
| 3.628539514896124 | 1.808 | 1.675 | 3.851 |
| 3.631681107549714 | 1.808 | 1.676 | 3.859 |
| 3.634822700203303 | 1.809 | 1.677 | 3.867 |
| 3.637964292856893 | 1.809 | 1.678 | 3.875 |
| 3.641105885510483 | 1.81 | 1.679 | 3.883 |
| 3.644247478164072 | 1.81 | 1.68 | 3.891 |
| 3.647389070817662 | 1.81 | 1.681 | 3.899 |
| 3.650530663471251 | 1.811 | 1.682 | 3.908 |
| 3.653672256124841 | 1.811 | 1.683 | 3.916 |
| 3.656813848778431 | 1.812 | 1.685 | 3.924 |
| 3.65995544143202 | 1.812 | 1.686 | 3.932 |
| 3.66309703408561 | 1.812 | 1.687 | 3.941 |
| 3.666238626739199 | 1.813 | 1.688 | 3.949 |
| 3.66938021939279 | 1.813 | 1.689 | 3.957 |
| 3.672521812046378 | 1.814 | 1.69 | 3.966 |
| 3.675663404699968 | 1.814 | 1.691 | 3.974 |
| 3.678804997353558 | 1.815 | 1.693 | 3.982 |
| 3.681946590007147 | 1.815 | 1.694 | 3.991 |
| 3.685088182660737 | 1.816 | 1.695 | 3.999 |
| 3.688229775314326 | 1.816 | 1.696 | 4.008 |
| 3.691371367967916 | 1.817 | 1.698 | 4.016 |
| 3.694512960621506 | 1.817 | 1.699 | 4.025 |
| 3.697654553275095 | 1.818 | 1.7 | 4.033 |
| 3.700796145928685 | 1.818 | 1.701 | 4.042 |
| 3.703937738582274 | 1.818 | 1.703 | 4.05 |
| 3.707079331235864 | 1.819 | 1.704 | 4.059 |
| 3.710220923889454 | 1.819 | 1.705 | 4.067 |
| 3.713362516543043 | 1.82 | 1.707 | 4.076 |
| 3.716504109196633 | 1.821 | 1.708 | 4.085 |
| 3.719645701850223 | 1.821 | 1.709 | 4.093 |
| 3.722787294503812 | 1.822 | 1.711 | 4.102 |
| 3.725928887157402 | 1.822 | 1.712 | 4.111 |
| 3.729070479810991 | 1.823 | 1.713 | 4.119 |
| 3.732212072464581 | 1.823 | 1.715 | 4.128 |
| 3.735353665118171 | 1.824 | 1.716 | 4.136 |
| 3.73849525777176 | 1.824 | 1.718 | 4.145 |
| 3.74163685042535 | 1.825 | 1.719 | 4.154 |
| 3.744778443078939 | 1.825 | 1.72 | 4.162 |
| 3.747920035732529 | 1.826 | 1.722 | 4.171 |
| 3.751061628386119 | 1.827 | 1.723 | 4.18 |
| 3.754203221039708 | 1.827 | 1.725 | 4.189 |
| 3.757344813693298 | 1.828 | 1.726 | 4.197 |
| 3.760486406346887 | 1.828 | 1.728 | 4.206 |
| 3.763627999000477 | 1.829 | 1.729 | 4.215 |
| 3.766769591654067 | 1.83 | 1.731 | 4.223 |
| 3.769911184307656 | 1.83 | 1.732 | 4.232 |
| 3.773052776961246 | 1.831 | 1.734 | 4.241 |
| 3.776194369614835 | 1.831 | 1.736 | 4.25 |
| 3.779335962268425 | 1.832 | 1.737 | 4.258 |
| 3.782477554922014 | 1.833 | 1.739 | 4.267 |
| 3.785619147575604 | 1.833 | 1.74 | 4.276 |
| 3.788760740229193 | 1.834 | 1.742 | 4.284 |
| 3.791902332882783 | 1.835 | 1.744 | 4.293 |
| 3.795043925536373 | 1.835 | 1.745 | 4.302 |
| 3.798185518189962 | 1.836 | 1.747 | 4.311 |
| 3.801327110843552 | 1.837 | 1.748 | 4.319 |
| 3.804468703497142 | 1.837 | 1.75 | 4.328 |
| 3.807610296150731 | 1.838 | 1.752 | 4.337 |
| 3.810751888804321 | 1.839 | 1.754 | 4.346 |
| 3.813893481457911 | 1.839 | 1.755 | 4.354 |
| 3.8170350741115 | 1.84 | 1.757 | 4.363 |
| 3.82017666676509 | 1.841 | 1.759 | 4.372 |
| 3.823318259418679 | 1.842 | 1.76 | 4.38 |
| 3.826459852072269 | 1.842 | 1.762 | 4.389 |
| 3.829601444725859 | 1.843 | 1.764 | 4.398 |
| 3.832743037379448 | 1.844 | 1.766 | 4.406 |
| 3.835884630033038 | 1.845 | 1.768 | 4.415 |
| 3.839026222686627 | 1.845 | 1.769 | 4.424 |
| 3.842167815340217 | 1.846 | 1.771 | 4.432 |
| 3.845309407993807 | 1.847 | 1.773 | 4.441 |
| 3.848451000647396 | 1.848 | 1.775 | 4.45 |
| 3.851592593300986 | 1.848 | 1.777 | 4.458 |
| 3.854734185954575 | 1.849 | 1.779 | 4.467 |
| 3.857875778608165 | 1.85 | 1.78 | 4.476 |
| 3.861017371261755 | 1.851 | 1.782 | 4.484 |
| 3.864158963915344 | 1.852 | 1.784 | 4.493 |
| 3.867300556568933 | 1.852 | 1.786 | 4.501 |
| 3.870442149222523 | 1.853 | 1.788 | 4.51 |
| 3.873583741876112 | 1.854 | 1.79 | 4.518 |
| 3.876725334529703 | 1.855 | 1.792 | 4.527 |
| 3.879866927183292 | 1.856 | 1.794 | 4.536 |
| 3.883008519836882 | 1.857 | 1.796 | 4.544 |
| 3.886150112490471 | 1.857 | 1.798 | 4.553 |
| 3.889291705144061 | 1.858 | 1.8 | 4.561 |
| 3.892433297797651 | 1.859 | 1.802 | 4.57 |
| 3.89557489045124 | 1.86 | 1.804 | 4.578 |
| 3.89871648310483 | 1.861 | 1.806 | 4.587 |
| 3.901858075758419 | 1.862 | 1.808 | 4.595 |
| 3.904999668412009 | 1.863 | 1.81 | 4.603 |
| 3.908141261065598 | 1.864 | 1.812 | 4.612 |
| 3.911282853719188 | 1.865 | 1.814 | 4.62 |
| 3.914424446372778 | 1.866 | 1.816 | 4.629 |
| 3.917566039026367 | 1.866 | 1.818 | 4.637 |
| 3.920707631679957 | 1.867 | 1.82 | 4.645 |
| 3.923849224333547 | 1.868 | 1.822 | 4.654 |
| 3.926990816987136 | 1.869 | 1.825 | 4.662 |
| 3.930132409640726 | 1.87 | 1.827 | 4.67 |
| 3.933274002294315 | 1.871 | 1.829 | 4.679 |
| 3.936415594947905 | 1.872 | 1.831 | 4.687 |
| 3.939557187601495 | 1.873 | 1.833 | 4.695 |
| 3.942698780255084 | 1.874 | 1.835 | 4.704 |
| 3.945840372908674 | 1.875 | 1.837 | 4.712 |
| 3.948981965562263 | 1.876 | 1.84 | 4.72 |
| 3.952123558215853 | 1.877 | 1.842 | 4.728 |
| 3.955265150869442 | 1.878 | 1.844 | 4.736 |
| 3.958406743523032 | 1.879 | 1.846 | 4.745 |
| 3.961548336176622 | 1.88 | 1.849 | 4.753 |
| 3.964689928830211 | 1.881 | 1.851 | 4.761 |
| 3.967831521483801 | 1.882 | 1.853 | 4.769 |
| 3.97097311413739 | 1.883 | 1.855 | 4.777 |
| 3.97411470679098 | 1.884 | 1.858 | 4.785 |
| 3.97725629944457 | 1.886 | 1.86 | 4.793 |
| 3.98039789209816 | 1.887 | 1.862 | 4.801 |
| 3.983539484751749 | 1.888 | 1.865 | 4.809 |
| 3.986681077405338 | 1.889 | 1.867 | 4.817 |
| 3.989822670058928 | 1.89 | 1.869 | 4.825 |
| 3.992964262712517 | 1.891 | 1.872 | 4.833 |
| 3.996105855366107 | 1.892 | 1.874 | 4.841 |
| 3.999247448019697 | 1.893 | 1.876 | 4.849 |
| 4.002389040673287 | 1.894 | 1.879 | 4.857 |
| 4.005530633326877 | 1.896 | 1.881 | 4.865 |
| 4.008672225980466 | 1.897 | 1.884 | 4.873 |
| 4.011813818634056 | 1.898 | 1.886 | 4.881 |
| 4.014955411287645 | 1.899 | 1.888 | 4.888 |
| 4.018097003941234 | 1.9 | 1.891 | 4.896 |
| 4.021238596594824 | 1.901 | 1.893 | 4.904 |
| 4.024380189248414 | 1.903 | 1.896 | 4.912 |
| 4.027521781902004 | 1.904 | 1.898 | 4.919 |
| 4.030663374555593 | 1.905 | 1.901 | 4.927 |
| 4.033804967209183 | 1.906 | 1.903 | 4.935 |
| 4.036946559862773 | 1.907 | 1.906 | 4.942 |
| 4.040088152516362 | 1.909 | 1.908 | 4.95 |
| 4.043229745169951 | 1.91 | 1.911 | 4.958 |
| 4.046371337823541 | 1.911 | 1.913 | 4.965 |
| 4.049512930477131 | 1.912 | 1.916 | 4.973 |
| 4.05265452313072 | 1.914 | 1.918 | 4.981 |
| 4.05579611578431 | 1.915 | 1.921 | 4.988 |
| 4.0589377084379 | 1.916 | 1.923 | 4.996 |
| 4.062079301091489 | 1.917 | 1.926 | 5.003 |
| 4.065220893745079 | 1.919 | 1.929 | 5.011 |
| 4.068362486398668 | 1.92 | 1.931 | 5.018 |
| 4.071504079052258 | 1.921 | 1.934 | 5.025 |
| 4.074645671705848 | 1.923 | 1.936 | 5.033 |
| 4.077787264359437 | 1.924 | 1.939 | 5.04 |
| 4.080928857013027 | 1.925 | 1.942 | 5.048 |
| 4.084070449666616 | 1.927 | 1.944 | 5.055 |
| 4.087212042320206 | 1.928 | 1.947 | 5.062 |
| 4.090353634973795 | 1.929 | 1.95 | 5.07 |
| 4.093495227627385 | 1.931 | 1.952 | 5.077 |
| 4.096636820280975 | 1.932 | 1.955 | 5.084 |
| 4.099778412934564 | 1.933 | 1.958 | 5.091 |
| 4.102920005588154 | 1.935 | 1.96 | 5.098 |
| 4.106061598241744 | 1.936 | 1.963 | 5.106 |
| 4.109203190895333 | 1.938 | 1.966 | 5.113 |
| 4.112344783548923 | 1.939 | 1.968 | 5.12 |
| 4.115486376202512 | 1.941 | 1.971 | 5.127 |
| 4.118627968856102 | 1.942 | 1.974 | 5.134 |
| 4.121769561509692 | 1.943 | 1.977 | 5.141 |
| 4.124911154163281 | 1.945 | 1.979 | 5.148 |
| 4.128052746816871 | 1.946 | 1.982 | 5.155 |
| 4.13119433947046 | 1.948 | 1.985 | 5.162 |
| 4.13433593212405 | 1.949 | 1.988 | 5.169 |
| 4.13747752477764 | 1.951 | 1.99 | 5.176 |
| 4.14061911743123 | 1.952 | 1.993 | 5.183 |
| 4.143760710084818 | 1.954 | 1.996 | 5.19 |
| 4.146902302738408 | 1.955 | 1.999 | 5.197 |
| 4.150043895391998 | 1.957 | 2.002 | 5.204 |
| 4.153185488045588 | 1.958 | 2.004 | 5.21 |
| 4.156327080699177 | 1.96 | 2.007 | 5.217 |
| 4.159468673352766 | 1.961 | 2.01 | 5.224 |
| 4.162610266006356 | 1.963 | 2.013 | 5.231 |
| 4.165751858659946 | 1.965 | 2.016 | 5.238 |
| 4.168893451313535 | 1.966 | 2.019 | 5.244 |
| 4.172035043967125 | 1.968 | 2.022 | 5.251 |
| 4.175176636620715 | 1.969 | 2.024 | 5.258 |
| 4.178318229274304 | 1.971 | 2.027 | 5.264 |
| 4.181459821927894 | 1.973 | 2.03 | 5.271 |
| 4.184601414581484 | 1.974 | 2.033 | 5.277 |
| 4.187743007235073 | 1.976 | 2.036 | 5.284 |
| 4.190884599888663 | 1.977 | 2.039 | 5.291 |
| 4.194026192542252 | 1.979 | 2.042 | 5.297 |
| 4.197167785195842 | 1.981 | 2.045 | 5.304 |
| 4.200309377849432 | 1.982 | 2.048 | 5.31 |
| 4.203450970503021 | 1.984 | 2.051 | 5.316 |
| 4.206592563156611 | 1.986 | 2.054 | 5.323 |
| 4.2097341558102 | 1.987 | 2.056 | 5.329 |
| 4.21287574846379 | 1.989 | 2.059 | 5.336 |
| 4.21601734111738 | 1.991 | 2.062 | 5.342 |
| 4.21915893377097 | 1.993 | 2.065 | 5.348 |
| 4.222300526424559 | 1.994 | 2.068 | 5.355 |
| 4.225442119078148 | 1.996 | 2.071 | 5.361 |
| 4.228583711731738 | 1.998 | 2.074 | 5.367 |
| 4.231725304385327 | 2 | 2.077 | 5.373 |
| 4.234866897038917 | 2.001 | 2.08 | 5.38 |
| 4.238008489692506 | 2.003 | 2.083 | 5.386 |
| 4.241150082346096 | 2.005 | 2.086 | 5.392 |
| 4.244291674999685 | 2.007 | 2.089 | 5.398 |
| 4.247433267653276 | 2.008 | 2.092 | 5.404 |
| 4.250574860306865 | 2.01 | 2.095 | 5.41 |
| 4.253716452960455 | 2.012 | 2.098 | 5.416 |
| 4.256858045614044 | 2.014 | 2.101 | 5.422 |
| 4.259999638267634 | 2.016 | 2.105 | 5.428 |
| 4.263141230921224 | 2.018 | 2.108 | 5.434 |
| 4.266282823574813 | 2.019 | 2.111 | 5.44 |
| 4.269424416228403 | 2.021 | 2.114 | 5.446 |
| 4.272566008881992 | 2.023 | 2.117 | 5.452 |
| 4.275707601535582 | 2.025 | 2.12 | 5.458 |
| 4.27884919418917 | 2.027 | 2.123 | 5.464 |
| 4.28199078684276 | 2.029 | 2.126 | 5.47 |
| 4.285132379496351 | 2.031 | 2.129 | 5.476 |
| 4.28827397214994 | 2.033 | 2.132 | 5.482 |
| 4.29141556480353 | 2.035 | 2.135 | 5.487 |
| 4.294557157457119 | 2.037 | 2.138 | 5.493 |
| 4.29769875011071 | 2.038 | 2.142 | 5.499 |
| 4.300840342764299 | 2.04 | 2.145 | 5.505 |
| 4.303981935417888 | 2.042 | 2.148 | 5.51 |
| 4.307123528071478 | 2.044 | 2.151 | 5.516 |
| 4.310265120725067 | 2.046 | 2.154 | 5.522 |
| 4.313406713378657 | 2.048 | 2.157 | 5.527 |
| 4.316548306032247 | 2.05 | 2.16 | 5.533 |
| 4.319689898685836 | 2.052 | 2.163 | 5.538 |
| 4.322831491339426 | 2.054 | 2.167 | 5.544 |
| 4.325973083993015 | 2.056 | 2.17 | 5.55 |
| 4.329114676646605 | 2.058 | 2.173 | 5.555 |
| 4.332256269300195 | 2.061 | 2.176 | 5.561 |
| 4.335397861953784 | 2.063 | 2.179 | 5.566 |
| 4.338539454607374 | 2.065 | 2.182 | 5.571 |
| 4.341681047260963 | 2.067 | 2.186 | 5.577 |
| 4.344822639914553 | 2.069 | 2.189 | 5.582 |
| 4.347964232568143 | 2.071 | 2.192 | 5.588 |
| 4.351105825221732 | 2.073 | 2.195 | 5.593 |
| 4.354247417875322 | 2.075 | 2.198 | 5.598 |
| 4.357389010528911 | 2.077 | 2.201 | 5.604 |
| 4.360530603182501 | 2.079 | 2.205 | 5.609 |
| 4.36367219583609 | 2.082 | 2.208 | 5.614 |
| 4.36681378848968 | 2.084 | 2.211 | 5.619 |
| 4.36995538114327 | 2.086 | 2.214 | 5.625 |
| 4.373096973796859 | 2.088 | 2.217 | 5.63 |
| 4.376238566450449 | 2.09 | 2.221 | 5.635 |
| 4.379380159104038 | 2.092 | 2.224 | 5.64 |
| 4.382521751757628 | 2.095 | 2.227 | 5.645 |
| 4.385663344411217 | 2.097 | 2.23 | 5.65 |
| 4.388804937064807 | 2.099 | 2.234 | 5.656 |
| 4.391946529718397 | 2.101 | 2.237 | 5.661 |
| 4.395088122371987 | 2.103 | 2.24 | 5.666 |
| 4.398229715025576 | 2.106 | 2.243 | 5.671 |
| 4.401371307679165 | 2.108 | 2.246 | 5.676 |
| 4.404512900332755 | 2.11 | 2.25 | 5.681 |
| 4.407654492986345 | 2.113 | 2.253 | 5.686 |
| 4.410796085639934 | 2.115 | 2.256 | 5.691 |
| 4.413937678293524 | 2.117 | 2.259 | 5.695 |
| 4.417079270947114 | 2.119 | 2.263 | 5.7 |
| 4.420220863600703 | 2.122 | 2.266 | 5.705 |
| 4.423362456254293 | 2.124 | 2.269 | 5.71 |
| 4.426504048907883 | 2.126 | 2.272 | 5.715 |
| 4.429645641561472 | 2.129 | 2.276 | 5.72 |
| 4.432787234215062 | 2.131 | 2.279 | 5.725 |
| 4.435928826868651 | 2.133 | 2.282 | 5.729 |
| 4.43907041952224 | 2.136 | 2.285 | 5.734 |
| 4.44221201217583 | 2.138 | 2.289 | 5.739 |
| 4.44535360482942 | 2.141 | 2.292 | 5.743 |
| 4.44849519748301 | 2.143 | 2.295 | 5.748 |
| 4.4516367901366 | 2.145 | 2.298 | 5.753 |
| 4.454778382790188 | 2.148 | 2.302 | 5.757 |
| 4.457919975443779 | 2.15 | 2.305 | 5.762 |
| 4.461061568097368 | 2.153 | 2.308 | 5.767 |
| 4.464203160750958 | 2.155 | 2.311 | 5.771 |
| 4.467344753404547 | 2.157 | 2.315 | 5.776 |
| 4.470486346058137 | 2.16 | 2.318 | 5.78 |
| 4.473627938711726 | 2.162 | 2.321 | 5.785 |
| 4.476769531365316 | 2.165 | 2.324 | 5.789 |
| 4.479911124018905 | 2.167 | 2.328 | 5.794 |
| 4.483052716672495 | 2.17 | 2.331 | 5.798 |
| 4.486194309326085 | 2.172 | 2.334 | 5.803 |
| 4.489335901979674 | 2.175 | 2.338 | 5.807 |
| 4.492477494633264 | 2.177 | 2.341 | 5.812 |
| 4.495619087286854 | 2.18 | 2.344 | 5.816 |
| 4.498760679940443 | 2.183 | 2.347 | 5.82 |
| 4.501902272594033 | 2.185 | 2.351 | 5.825 |
| 4.505043865247622 | 2.188 | 2.354 | 5.829 |
| 4.508185457901212 | 2.19 | 2.357 | 5.833 |
| 4.511327050554801 | 2.193 | 2.36 | 5.838 |
| 4.514468643208391 | 2.195 | 2.364 | 5.842 |
| 4.517610235861981 | 2.198 | 2.367 | 5.846 |
| 4.520751828515571 | 2.201 | 2.37 | 5.85 |
| 4.52389342116916 | 2.203 | 2.374 | 5.855 |
| 4.52703501382275 | 2.206 | 2.377 | 5.859 |
| 4.530176606476339 | 2.208 | 2.38 | 5.863 |
| 4.533318199129928 | 2.211 | 2.383 | 5.867 |
| 4.536459791783518 | 2.214 | 2.387 | 5.871 |
| 4.539601384437108 | 2.216 | 2.39 | 5.875 |
| 4.542742977090698 | 2.219 | 2.393 | 5.879 |
| 4.545884569744287 | 2.222 | 2.396 | 5.883 |
| 4.549026162397876 | 2.224 | 2.4 | 5.887 |
| 4.552167755051466 | 2.227 | 2.403 | 5.892 |
| 4.555309347705056 | 2.23 | 2.406 | 5.896 |
| 4.558450940358646 | 2.233 | 2.41 | 5.9 |
| 4.561592533012235 | 2.235 | 2.413 | 5.904 |
| 4.564734125665825 | 2.238 | 2.416 | 5.907 |
| 4.567875718319415 | 2.241 | 2.419 | 5.911 |
| 4.571017310973004 | 2.244 | 2.423 | 5.915 |
| 4.574158903626594 | 2.246 | 2.426 | 5.919 |
| 4.577300496280183 | 2.249 | 2.429 | 5.923 |
| 4.580442088933772 | 2.252 | 2.432 | 5.927 |
| 4.583583681587362 | 2.255 | 2.436 | 5.931 |
| 4.586725274240952 | 2.258 | 2.439 | 5.935 |
| 4.589866866894542 | 2.26 | 2.442 | 5.938 |
| 4.593008459548131 | 2.263 | 2.445 | 5.942 |
| 4.596150052201721 | 2.266 | 2.449 | 5.946 |
| 4.59929164485531 | 2.269 | 2.452 | 5.95 |
| 4.6024332375089 | 2.272 | 2.455 | 5.954 |
| 4.60557483016249 | 2.274 | 2.458 | 5.957 |
| 4.608716422816079 | 2.277 | 2.462 | 5.961 |
| 4.611858015469668 | 2.28 | 2.465 | 5.965 |
| 4.614999608123258 | 2.283 | 2.468 | 5.968 |
| 4.618141200776848 | 2.286 | 2.471 | 5.972 |
| 4.621282793430437 | 2.289 | 2.475 | 5.976 |
| 4.624424386084027 | 2.292 | 2.478 | 5.979 |
| 4.627565978737617 | 2.295 | 2.481 | 5.983 |
| 4.630707571391206 | 2.298 | 2.484 | 5.986 |
| 4.633849164044795 | 2.301 | 2.487 | 5.99 |
| 4.636990756698386 | 2.303 | 2.491 | 5.993 |
| 4.640132349351975 | 2.306 | 2.494 | 5.997 |
| 4.643273942005564 | 2.309 | 2.497 | 6.001 |
| 4.646415534659154 | 2.312 | 2.5 | 6.004 |
| 4.649557127312744 | 2.315 | 2.504 | 6.008 |
| 4.652698719966334 | 2.318 | 2.507 | 6.011 |
| 4.655840312619923 | 2.321 | 2.51 | 6.014 |
| 4.658981905273513 | 2.324 | 2.513 | 6.018 |
| 4.662123497927102 | 2.327 | 2.516 | 6.021 |
| 4.665265090580692 | 2.33 | 2.52 | 6.025 |
| 4.668406683234282 | 2.333 | 2.523 | 6.028 |
| 4.671548275887871 | 2.336 | 2.526 | 6.031 |
| 4.674689868541461 | 2.339 | 2.529 | 6.035 |
| 4.67783146119505 | 2.342 | 2.532 | 6.038 |
| 4.68097305384864 | 2.346 | 2.535 | 6.041 |
| 4.68411464650223 | 2.349 | 2.539 | 6.045 |
| 4.687256239155819 | 2.352 | 2.542 | 6.048 |
| 4.690397831809409 | 2.355 | 2.545 | 6.051 |
| 4.693539424462998 | 2.358 | 2.548 | 6.054 |
| 4.696681017116588 | 2.361 | 2.551 | 6.058 |
| 4.699822609770177 | 2.364 | 2.554 | 6.061 |
| 4.702964202423767 | 2.367 | 2.558 | 6.064 |
| 4.706105795077356 | 2.37 | 2.561 | 6.067 |
| 4.709247387730946 | 2.373 | 2.564 | 6.07 |
| 4.712388980384535 | 2.377 | 2.567 | 6.074 |
| 4.715530573038126 | 2.38 | 2.57 | 6.077 |
| 4.718672165691715 | 2.383 | 2.573 | 6.08 |
| 4.721813758345305 | 2.386 | 2.576 | 6.083 |
| 4.724955350998894 | 2.389 | 2.58 | 6.086 |
| 4.728096943652484 | 2.392 | 2.583 | 6.089 |
| 4.731238536306074 | 2.396 | 2.586 | 6.092 |
| 4.734380128959663 | 2.399 | 2.589 | 6.095 |
| 4.737521721613253 | 2.402 | 2.592 | 6.098 |
| 4.740663314266842 | 2.405 | 2.595 | 6.101 |
| 4.743804906920432 | 2.408 | 2.598 | 6.104 |
| 4.74694649957402 | 2.412 | 2.601 | 6.107 |
| 4.750088092227611 | 2.415 | 2.604 | 6.11 |
| 4.7532296848812 | 2.418 | 2.608 | 6.113 |
| 4.75637127753479 | 2.421 | 2.611 | 6.116 |
| 4.75951287018838 | 2.425 | 2.614 | 6.119 |
| 4.76265446284197 | 2.428 | 2.617 | 6.122 |
| 4.765796055495559 | 2.431 | 2.62 | 6.125 |
| 4.768937648149149 | 2.434 | 2.623 | 6.128 |
| 4.772079240802738 | 2.438 | 2.626 | 6.13 |
| 4.775220833456327 | 2.441 | 2.629 | 6.133 |
| 4.778362426109917 | 2.444 | 2.632 | 6.136 |
| 4.781504018763507 | 2.448 | 2.635 | 6.139 |
| 4.784645611417097 | 2.451 | 2.638 | 6.142 |
| 4.787787204070686 | 2.454 | 2.641 | 6.145 |
| 4.790928796724275 | 2.457 | 2.644 | 6.147 |
| 4.794070389377865 | 2.461 | 2.647 | 6.15 |
| 4.797211982031455 | 2.464 | 2.65 | 6.153 |
| 4.800353574685045 | 2.467 | 2.653 | 6.156 |
| 4.803495167338634 | 2.471 | 2.656 | 6.158 |
| 4.806636759992224 | 2.474 | 2.659 | 6.161 |
| 4.809778352645814 | 2.478 | 2.662 | 6.164 |
| 4.812919945299403 | 2.481 | 2.665 | 6.166 |
| 4.816061537952993 | 2.484 | 2.668 | 6.169 |
| 4.819203130606582 | 2.488 | 2.671 | 6.172 |
| 4.822344723260172 | 2.491 | 2.674 | 6.174 |
| 4.825486315913761 | 2.494 | 2.677 | 6.177 |
| 4.828627908567351 | 2.498 | 2.68 | 6.179 |
| 4.83176950122094 | 2.501 | 2.683 | 6.182 |
| 4.83491109387453 | 2.505 | 2.686 | 6.185 |
| 4.83805268652812 | 2.508 | 2.689 | 6.187 |
| 4.841194279181709 | 2.512 | 2.692 | 6.19 |
| 4.844335871835299 | 2.515 | 2.695 | 6.192 |
| 4.847477464488889 | 2.518 | 2.698 | 6.195 |
| 4.850619057142478 | 2.522 | 2.701 | 6.197 |
| 4.853760649796068 | 2.525 | 2.704 | 6.2 |
| 4.856902242449657 | 2.529 | 2.707 | 6.202 |
| 4.860043835103247 | 2.532 | 2.709 | 6.205 |
| 4.863185427756837 | 2.536 | 2.712 | 6.207 |
| 4.866327020410426 | 2.539 | 2.715 | 6.21 |
| 4.869468613064015 | 2.543 | 2.718 | 6.212 |
| 4.872610205717605 | 2.546 | 2.721 | 6.214 |
| 4.875751798371195 | 2.55 | 2.724 | 6.217 |
| 4.878893391024784 | 2.553 | 2.727 | 6.219 |
| 4.882034983678374 | 2.557 | 2.73 | 6.222 |
| 4.885176576331964 | 2.56 | 2.732 | 6.224 |
| 4.888318168985553 | 2.564 | 2.735 | 6.226 |
| 4.891459761639143 | 2.567 | 2.738 | 6.229 |
| 4.894601354292733 | 2.571 | 2.741 | 6.231 |
| 4.897742946946322 | 2.574 | 2.744 | 6.233 |
| 4.900884539599912 | 2.578 | 2.747 | 6.236 |
| 4.904026132253501 | 2.581 | 2.749 | 6.238 |
| 4.907167724907091 | 2.585 | 2.752 | 6.24 |
| 4.91030931756068 | 2.589 | 2.755 | 6.242 |
| 4.91345091021427 | 2.592 | 2.758 | 6.245 |
| 4.91659250286786 | 2.596 | 2.761 | 6.247 |
| 4.91973409552145 | 2.599 | 2.763 | 6.249 |
| 4.922875688175039 | 2.603 | 2.766 | 6.251 |
| 4.926017280828628 | 2.606 | 2.769 | 6.254 |
| 4.929158873482218 | 2.61 | 2.772 | 6.256 |
| 4.932300466135808 | 2.614 | 2.774 | 6.258 |
| 4.935442058789397 | 2.617 | 2.777 | 6.26 |
| 4.938583651442987 | 2.621 | 2.78 | 6.262 |
| 4.941725244096576 | 2.624 | 2.783 | 6.264 |
| 4.944866836750166 | 2.628 | 2.785 | 6.267 |
| 4.948008429403755 | 2.632 | 2.788 | 6.269 |
| 4.951150022057345 | 2.635 | 2.791 | 6.271 |
| 4.954291614710935 | 2.639 | 2.794 | 6.273 |
| 4.957433207364524 | 2.642 | 2.796 | 6.275 |
| 4.960574800018114 | 2.646 | 2.799 | 6.277 |
| 4.963716392671704 | 2.65 | 2.802 | 6.279 |
| 4.966857985325293 | 2.653 | 2.804 | 6.281 |
| 4.969999577978883 | 2.657 | 2.807 | 6.283 |
| 4.973141170632472 | 2.661 | 2.81 | 6.285 |
| 4.976282763286062 | 2.664 | 2.812 | 6.287 |
| 4.979424355939651 | 2.668 | 2.815 | 6.289 |
| 4.982565948593241 | 2.672 | 2.817 | 6.291 |
| 4.985707541246831 | 2.675 | 2.82 | 6.293 |
| 4.98884913390042 | 2.679 | 2.823 | 6.295 |
| 4.99199072655401 | 2.683 | 2.825 | 6.297 |
| 4.9951323192076 | 2.686 | 2.828 | 6.299 |
| 4.99827391186119 | 2.69 | 2.831 | 6.301 |
| 5.00141550451478 | 2.694 | 2.833 | 6.303 |
| 5.004557097168369 | 2.697 | 2.836 | 6.305 |
| 5.007698689821958 | 2.701 | 2.838 | 6.307 |
| 5.010840282475548 | 2.705 | 2.841 | 6.308 |
| 5.013981875129137 | 2.708 | 2.843 | 6.31 |
| 5.017123467782727 | 2.712 | 2.846 | 6.312 |
| 5.020265060436317 | 2.716 | 2.848 | 6.314 |
| 5.023406653089906 | 2.719 | 2.851 | 6.316 |
| 5.026548245743496 | 2.723 | 2.854 | 6.318 |
| 5.029689838397085 | 2.727 | 2.856 | 6.32 |
| 5.032831431050674 | 2.73 | 2.859 | 6.321 |
| 5.035973023704264 | 2.734 | 2.861 | 6.323 |
| 5.039114616357854 | 2.738 | 2.864 | 6.325 |
| 5.042256209011444 | 2.742 | 2.866 | 6.327 |
| 5.045397801665033 | 2.745 | 2.869 | 6.329 |
| 5.048539394318622 | 2.749 | 2.871 | 6.33 |
| 5.051680986972213 | 2.753 | 2.873 | 6.332 |
| 5.054822579625802 | 2.756 | 2.876 | 6.334 |
| 5.057964172279392 | 2.76 | 2.878 | 6.336 |
| 5.061105764932981 | 2.764 | 2.881 | 6.337 |
| 5.064247357586571 | 2.768 | 2.883 | 6.339 |
| 5.067388950240161 | 2.771 | 2.886 | 6.341 |
| 5.07053054289375 | 2.775 | 2.888 | 6.342 |
| 5.07367213554734 | 2.779 | 2.89 | 6.344 |
| 5.07681372820093 | 2.783 | 2.893 | 6.346 |
| 5.079955320854519 | 2.786 | 2.895 | 6.347 |
| 5.083096913508108 | 2.79 | 2.898 | 6.349 |
| 5.086238506161698 | 2.794 | 2.9 | 6.351 |
| 5.089380098815288 | 2.797 | 2.902 | 6.352 |
| 5.092521691468877 | 2.801 | 2.905 | 6.354 |
| 5.095663284122466 | 2.805 | 2.907 | 6.355 |
| 5.098804876776057 | 2.809 | 2.909 | 6.357 |
| 5.101946469429646 | 2.812 | 2.912 | 6.359 |
| 5.105088062083236 | 2.816 | 2.914 | 6.36 |
| 5.108229654736825 | 2.82 | 2.916 | 6.362 |
| 5.111371247390415 | 2.824 | 2.919 | 6.363 |
| 5.114512840044005 | 2.827 | 2.921 | 6.365 |
| 5.117654432697594 | 2.831 | 2.923 | 6.366 |
| 5.120796025351184 | 2.835 | 2.925 | 6.368 |
| 5.123937618004773 | 2.839 | 2.928 | 6.369 |
| 5.127079210658363 | 2.842 | 2.93 | 6.371 |
| 5.130220803311953 | 2.846 | 2.932 | 6.372 |
| 5.133362395965542 | 2.85 | 2.934 | 6.374 |
| 5.136503988619131 | 2.854 | 2.937 | 6.375 |
| 5.13964558127272 | 2.857 | 2.939 | 6.377 |
| 5.142787173926311 | 2.861 | 2.941 | 6.378 |
| 5.1459287665799 | 2.865 | 2.943 | 6.38 |
| 5.14907035923349 | 2.868 | 2.946 | 6.381 |
| 5.15221195188708 | 2.872 | 2.948 | 6.383 |
| 5.15535354454067 | 2.876 | 2.95 | 6.384 |
| 5.158495137194259 | 2.88 | 2.952 | 6.386 |
| 5.161636729847848 | 2.883 | 2.954 | 6.387 |
| 5.164778322501438 | 2.887 | 2.956 | 6.388 |
| 5.167919915155028 | 2.891 | 2.959 | 6.39 |
| 5.171061507808617 | 2.895 | 2.961 | 6.391 |
| 5.174203100462206 | 2.898 | 2.963 | 6.393 |
| 5.177344693115796 | 2.902 | 2.965 | 6.394 |
| 5.180486285769386 | 2.906 | 2.967 | 6.395 |
| 5.183627878422976 | 2.91 | 2.969 | 6.397 |
| 5.186769471076565 | 2.913 | 2.971 | 6.398 |
| 5.189911063730155 | 2.917 | 2.973 | 6.399 |
| 5.193052656383744 | 2.921 | 2.975 | 6.401 |
| 5.196194249037334 | 2.924 | 2.977 | 6.402 |
| 5.199335841690924 | 2.928 | 2.98 | 6.403 |
| 5.202477434344513 | 2.932 | 2.982 | 6.404 |
| 5.205619026998103 | 2.936 | 2.984 | 6.406 |
| 5.208760619651692 | 2.939 | 2.986 | 6.407 |
| 5.211902212305282 | 2.943 | 2.988 | 6.408 |
| 5.215043804958871 | 2.947 | 2.99 | 6.41 |
| 5.218185397612461 | 2.95 | 2.992 | 6.411 |
| 5.221326990266051 | 2.954 | 2.994 | 6.412 |
| 5.22446858291964 | 2.958 | 2.996 | 6.413 |
| 5.22761017557323 | 2.961 | 2.998 | 6.415 |
| 5.23075176822682 | 2.965 | 3 | 6.416 |
| 5.23389336088041 | 2.969 | 3.002 | 6.417 |
| 5.237034953533999 | 2.973 | 3.003 | 6.418 |
| 5.240176546187588 | 2.976 | 3.005 | 6.419 |
| 5.243318138841178 | 2.98 | 3.007 | 6.421 |
| 5.246459731494767 | 2.984 | 3.009 | 6.422 |
| 5.249601324148357 | 2.987 | 3.011 | 6.423 |
| 5.252742916801947 | 2.991 | 3.013 | 6.424 |
| 5.255884509455536 | 2.995 | 3.015 | 6.425 |
| 5.259026102109125 | 2.998 | 3.017 | 6.426 |
| 5.262167694762715 | 3.002 | 3.019 | 6.427 |
| 5.265309287416305 | 3.005 | 3.021 | 6.429 |
| 5.268450880069895 | 3.009 | 3.022 | 6.43 |
| 5.271592472723484 | 3.013 | 3.024 | 6.431 |
| 5.274734065377074 | 3.016 | 3.026 | 6.432 |
| 5.277875658030664 | 3.02 | 3.028 | 6.433 |
| 5.281017250684253 | 3.024 | 3.03 | 6.434 |
| 5.284158843337843 | 3.027 | 3.032 | 6.435 |
| 5.287300435991432 | 3.031 | 3.033 | 6.436 |
| 5.290442028645022 | 3.035 | 3.035 | 6.437 |
| 5.293583621298612 | 3.038 | 3.037 | 6.438 |
| 5.296725213952201 | 3.042 | 3.039 | 6.44 |
| 5.299866806605791 | 3.045 | 3.041 | 6.441 |
| 5.30300839925938 | 3.049 | 3.042 | 6.442 |
| 5.30614999191297 | 3.052 | 3.044 | 6.443 |
| 5.30929158456656 | 3.056 | 3.046 | 6.444 |
| 5.312433177220149 | 3.06 | 3.048 | 6.445 |
| 5.315574769873739 | 3.063 | 3.049 | 6.446 |
| 5.318716362527328 | 3.067 | 3.051 | 6.447 |
| 5.321857955180918 | 3.07 | 3.053 | 6.448 |
| 5.324999547834508 | 3.074 | 3.054 | 6.449 |
| 5.328141140488097 | 3.077 | 3.056 | 6.45 |
| 5.331282733141686 | 3.081 | 3.058 | 6.451 |
| 5.334424325795276 | 3.084 | 3.059 | 6.452 |
| 5.337565918448866 | 3.088 | 3.061 | 6.453 |
| 5.340707511102456 | 3.092 | 3.063 | 6.454 |
| 5.343849103756045 | 3.095 | 3.064 | 6.454 |
| 5.346990696409634 | 3.099 | 3.066 | 6.455 |
| 5.350132289063224 | 3.102 | 3.068 | 6.456 |
| 5.353273881716814 | 3.106 | 3.069 | 6.457 |
| 5.356415474370403 | 3.109 | 3.071 | 6.458 |
| 5.359557067023993 | 3.113 | 3.072 | 6.459 |
| 5.362698659677583 | 3.116 | 3.074 | 6.46 |
| 5.365840252331172 | 3.119 | 3.076 | 6.461 |
| 5.368981844984762 | 3.123 | 3.077 | 6.462 |
| 5.372123437638351 | 3.126 | 3.079 | 6.463 |
| 5.375265030291941 | 3.13 | 3.08 | 6.464 |
| 5.378406622945531 | 3.133 | 3.082 | 6.464 |
| 5.38154821559912 | 3.137 | 3.083 | 6.465 |
| 5.38468980825271 | 3.14 | 3.085 | 6.466 |
| 5.387831400906299 | 3.143 | 3.086 | 6.467 |
| 5.39097299355989 | 3.147 | 3.088 | 6.468 |
| 5.394114586213479 | 3.15 | 3.089 | 6.469 |
| 5.397256178867068 | 3.154 | 3.091 | 6.47 |
| 5.400397771520657 | 3.157 | 3.092 | 6.47 |
| 5.403539364174247 | 3.16 | 3.094 | 6.471 |
| 5.406680956827837 | 3.164 | 3.095 | 6.472 |
| 5.409822549481426 | 3.167 | 3.097 | 6.473 |
| 5.412964142135016 | 3.17 | 3.098 | 6.474 |
| 5.416105734788605 | 3.174 | 3.1 | 6.474 |
| 5.419247327442195 | 3.177 | 3.101 | 6.475 |
| 5.422388920095785 | 3.18 | 3.103 | 6.476 |
| 5.425530512749375 | 3.184 | 3.104 | 6.477 |
| 5.428672105402964 | 3.187 | 3.105 | 6.478 |
| 5.431813698056554 | 3.19 | 3.107 | 6.478 |
| 5.434955290710143 | 3.194 | 3.108 | 6.479 |
| 5.438096883363733 | 3.197 | 3.109 | 6.48 |
| 5.441238476017322 | 3.2 | 3.111 | 6.481 |
| 5.444380068670912 | 3.203 | 3.112 | 6.481 |
| 5.447521661324502 | 3.206 | 3.114 | 6.482 |
| 5.450663253978091 | 3.21 | 3.115 | 6.483 |
| 5.453804846631681 | 3.213 | 3.116 | 6.484 |
| 5.456946439285271 | 3.216 | 3.118 | 6.484 |
| 5.46008803193886 | 3.219 | 3.119 | 6.485 |
| 5.46322962459245 | 3.223 | 3.12 | 6.486 |
| 5.466371217246039 | 3.226 | 3.121 | 6.486 |
| 5.46951280989963 | 3.229 | 3.123 | 6.487 |
| 5.472654402553218 | 3.232 | 3.124 | 6.488 |
| 5.475795995206808 | 3.235 | 3.125 | 6.488 |
| 5.478937587860398 | 3.238 | 3.127 | 6.489 |
| 5.482079180513987 | 3.241 | 3.128 | 6.49 |
| 5.485220773167577 | 3.244 | 3.129 | 6.49 |
| 5.488362365821166 | 3.248 | 3.13 | 6.491 |
| 5.491503958474756 | 3.251 | 3.132 | 6.492 |
| 5.494645551128346 | 3.254 | 3.133 | 6.492 |
| 5.497787143781935 | 3.257 | 3.134 | 6.493 |
| 5.500928736435525 | 3.26 | 3.135 | 6.494 |
| 5.504070329089115 | 3.263 | 3.136 | 6.494 |
| 5.507211921742704 | 3.266 | 3.138 | 6.495 |
| 5.510353514396294 | 3.269 | 3.139 | 6.496 |
| 5.513495107049883 | 3.272 | 3.14 | 6.496 |
| 5.516636699703473 | 3.275 | 3.141 | 6.497 |
| 5.519778292357062 | 3.278 | 3.142 | 6.497 |
| 5.522919885010652 | 3.281 | 3.143 | 6.498 |
| 5.526061477664242 | 3.284 | 3.144 | 6.499 |
| 5.529203070317831 | 3.287 | 3.146 | 6.499 |
| 5.532344662971421 | 3.29 | 3.147 | 6.5 |
| 5.535486255625011 | 3.293 | 3.148 | 6.5 |
| 5.5386278482786 | 3.295 | 3.149 | 6.501 |
| 5.54176944093219 | 3.298 | 3.15 | 6.501 |
| 5.544911033585779 | 3.301 | 3.151 | 6.502 |
| 5.54805262623937 | 3.304 | 3.152 | 6.503 |
| 5.551194218892959 | 3.307 | 3.153 | 6.503 |
| 5.554335811546548 | 3.31 | 3.154 | 6.504 |
| 5.557477404200137 | 3.313 | 3.155 | 6.504 |
| 5.560618996853727 | 3.315 | 3.156 | 6.505 |
| 5.563760589507317 | 3.318 | 3.157 | 6.505 |
| 5.566902182160906 | 3.321 | 3.158 | 6.506 |
| 5.570043774814496 | 3.324 | 3.159 | 6.506 |
| 5.573185367468086 | 3.327 | 3.16 | 6.507 |
| 5.576326960121675 | 3.329 | 3.161 | 6.507 |
| 5.579468552775264 | 3.332 | 3.162 | 6.508 |
| 5.582610145428854 | 3.335 | 3.163 | 6.508 |
| 5.585751738082444 | 3.337 | 3.164 | 6.509 |
| 5.588893330736034 | 3.34 | 3.165 | 6.509 |
| 5.592034923389623 | 3.343 | 3.166 | 6.51 |
| 5.595176516043213 | 3.345 | 3.167 | 6.51 |
| 5.598318108696803 | 3.348 | 3.168 | 6.511 |
| 5.601459701350392 | 3.351 | 3.169 | 6.511 |
| 5.604601294003982 | 3.353 | 3.17 | 6.512 |
| 5.607742886657571 | 3.356 | 3.171 | 6.512 |
| 5.610884479311161 | 3.359 | 3.172 | 6.513 |
| 5.61402607196475 | 3.361 | 3.173 | 6.513 |
| 5.61716766461834 | 3.364 | 3.174 | 6.514 |
| 5.62030925727193 | 3.366 | 3.175 | 6.514 |
| 5.623450849925519 | 3.369 | 3.176 | 6.515 |
| 5.626592442579109 | 3.371 | 3.176 | 6.515 |
| 5.629734035232698 | 3.374 | 3.177 | 6.515 |
| 5.632875627886288 | 3.376 | 3.178 | 6.516 |
| 5.636017220539878 | 3.379 | 3.179 | 6.516 |
| 5.639158813193467 | 3.381 | 3.18 | 6.517 |
| 5.642300405847057 | 3.384 | 3.181 | 6.517 |
| 5.645441998500646 | 3.386 | 3.182 | 6.518 |
| 5.648583591154236 | 3.388 | 3.182 | 6.518 |
| 5.651725183807825 | 3.391 | 3.183 | 6.518 |
| 5.654866776461415 | 3.393 | 3.184 | 6.519 |
| 5.658008369115005 | 3.396 | 3.185 | 6.519 |
| 5.661149961768594 | 3.398 | 3.186 | 6.52 |
| 5.664291554422184 | 3.4 | 3.186 | 6.52 |
| 5.667433147075774 | 3.403 | 3.187 | 6.52 |
| 5.670574739729363 | 3.405 | 3.188 | 6.521 |
| 5.673716332382953 | 3.407 | 3.189 | 6.521 |
| 5.676857925036542 | 3.409 | 3.189 | 6.521 |
| 5.679999517690132 | 3.412 | 3.19 | 6.522 |
| 5.683141110343721 | 3.414 | 3.191 | 6.522 |
| 5.686282702997311 | 3.416 | 3.192 | 6.523 |
| 5.689424295650901 | 3.418 | 3.192 | 6.523 |
| 5.69256588830449 | 3.421 | 3.193 | 6.523 |
| 5.69570748095808 | 3.423 | 3.194 | 6.524 |
| 5.69884907361167 | 3.425 | 3.194 | 6.524 |
| 5.701990666265259 | 3.427 | 3.195 | 6.524 |
| 5.705132258918849 | 3.429 | 3.196 | 6.525 |
| 5.708273851572438 | 3.431 | 3.197 | 6.525 |
| 5.711415444226028 | 3.433 | 3.197 | 6.525 |
| 5.714557036879618 | 3.435 | 3.198 | 6.526 |
| 5.717698629533207 | 3.438 | 3.199 | 6.526 |
| 5.720840222186797 | 3.44 | 3.199 | 6.526 |
| 5.723981814840386 | 3.442 | 3.2 | 6.527 |
| 5.727123407493976 | 3.444 | 3.201 | 6.527 |
| 5.730265000147565 | 3.446 | 3.201 | 6.527 |
| 5.733406592801155 | 3.448 | 3.202 | 6.528 |
| 5.736548185454744 | 3.45 | 3.202 | 6.528 |
| 5.739689778108334 | 3.452 | 3.203 | 6.528 |
| 5.742831370761924 | 3.453 | 3.204 | 6.528 |
| 5.745972963415514 | 3.455 | 3.204 | 6.529 |
| 5.749114556069103 | 3.457 | 3.205 | 6.529 |
| 5.752256148722693 | 3.459 | 3.205 | 6.529 |
| 5.755397741376282 | 3.461 | 3.206 | 6.53 |
| 5.758539334029872 | 3.463 | 3.207 | 6.53 |
| 5.761680926683462 | 3.465 | 3.207 | 6.53 |
| 5.764822519337051 | 3.467 | 3.208 | 6.53 |
| 5.767964111990641 | 3.468 | 3.208 | 6.531 |
| 5.77110570464423 | 3.47 | 3.209 | 6.531 |
| 5.77424729729782 | 3.472 | 3.209 | 6.531 |
| 5.77738888995141 | 3.474 | 3.21 | 6.531 |
| 5.780530482605 | 3.475 | 3.21 | 6.532 |
| 5.783672075258588 | 3.477 | 3.211 | 6.532 |
| 5.786813667912178 | 3.479 | 3.211 | 6.532 |
| 5.789955260565768 | 3.481 | 3.212 | 6.532 |
| 5.793096853219358 | 3.482 | 3.213 | 6.533 |
| 5.796238445872947 | 3.484 | 3.213 | 6.533 |
| 5.799380038526537 | 3.485 | 3.213 | 6.533 |
| 5.802521631180126 | 3.487 | 3.214 | 6.533 |
| 5.805663223833715 | 3.489 | 3.214 | 6.534 |
| 5.808804816487306 | 3.49 | 3.215 | 6.534 |
| 5.811946409140895 | 3.492 | 3.215 | 6.534 |
| 5.815088001794485 | 3.493 | 3.216 | 6.534 |
| 5.818229594448074 | 3.495 | 3.216 | 6.534 |
| 5.821371187101663 | 3.496 | 3.217 | 6.535 |
| 5.824512779755254 | 3.498 | 3.217 | 6.535 |
| 5.827654372408843 | 3.499 | 3.218 | 6.535 |
| 5.830795965062433 | 3.501 | 3.218 | 6.535 |
| 5.833937557716022 | 3.502 | 3.219 | 6.536 |
| 5.837079150369612 | 3.504 | 3.219 | 6.536 |
| 5.840220743023201 | 3.505 | 3.219 | 6.536 |
| 5.843362335676791 | 3.507 | 3.22 | 6.536 |
| 5.846503928330381 | 3.508 | 3.22 | 6.536 |
| 5.84964552098397 | 3.509 | 3.221 | 6.536 |
| 5.85278711363756 | 3.511 | 3.221 | 6.537 |
| 5.85592870629115 | 3.512 | 3.221 | 6.537 |
| 5.85907029894474 | 3.513 | 3.222 | 6.537 |
| 5.862211891598329 | 3.515 | 3.222 | 6.537 |
| 5.865353484251918 | 3.516 | 3.223 | 6.537 |
| 5.868495076905508 | 3.517 | 3.223 | 6.538 |
| 5.871636669559098 | 3.519 | 3.223 | 6.538 |
| 5.874778262212687 | 3.52 | 3.224 | 6.538 |
| 5.877919854866277 | 3.521 | 3.224 | 6.538 |
| 5.881061447519866 | 3.522 | 3.224 | 6.538 |
| 5.884203040173456 | 3.523 | 3.225 | 6.538 |
| 5.887344632827046 | 3.525 | 3.225 | 6.539 |
| 5.890486225480635 | 3.526 | 3.225 | 6.539 |
| 5.893627818134224 | 3.527 | 3.226 | 6.539 |
| 5.896769410787814 | 3.528 | 3.226 | 6.539 |
| 5.899911003441404 | 3.529 | 3.226 | 6.539 |
| 5.903052596094994 | 3.53 | 3.227 | 6.539 |
| 5.906194188748583 | 3.531 | 3.227 | 6.539 |
| 5.909335781402172 | 3.533 | 3.227 | 6.54 |
| 5.912477374055762 | 3.534 | 3.227 | 6.54 |
| 5.915618966709352 | 3.535 | 3.228 | 6.54 |
| 5.918760559362942 | 3.536 | 3.228 | 6.54 |
| 5.921902152016531 | 3.537 | 3.228 | 6.54 |
| 5.92504374467012 | 3.538 | 3.229 | 6.54 |
| 5.92818533732371 | 3.539 | 3.229 | 6.54 |
| 5.9313269299773 | 3.54 | 3.229 | 6.54 |
| 5.93446852263089 | 3.541 | 3.229 | 6.541 |
| 5.93761011528448 | 3.541 | 3.23 | 6.541 |
| 5.940751707938068 | 3.542 | 3.23 | 6.541 |
| 5.943893300591658 | 3.543 | 3.23 | 6.541 |
| 5.947034893245248 | 3.544 | 3.23 | 6.541 |
| 5.950176485898837 | 3.545 | 3.231 | 6.541 |
| 5.953318078552427 | 3.546 | 3.231 | 6.541 |
| 5.956459671206017 | 3.547 | 3.231 | 6.541 |
| 5.959601263859606 | 3.548 | 3.231 | 6.541 |
| 5.962742856513196 | 3.548 | 3.232 | 6.542 |
| 5.965884449166785 | 3.549 | 3.232 | 6.542 |
| 5.969026041820375 | 3.55 | 3.232 | 6.542 |
| 5.972167634473964 | 3.551 | 3.232 | 6.542 |
| 5.975309227127554 | 3.552 | 3.232 | 6.542 |
| 5.978450819781144 | 3.552 | 3.233 | 6.542 |
| 5.981592412434733 | 3.553 | 3.233 | 6.542 |
| 5.984734005088323 | 3.554 | 3.233 | 6.542 |
| 5.987875597741913 | 3.554 | 3.233 | 6.542 |
| 5.991017190395502 | 3.555 | 3.233 | 6.542 |
| 5.994158783049092 | 3.556 | 3.234 | 6.542 |
| 5.997300375702681 | 3.556 | 3.234 | 6.543 |
| 6.000441968356271 | 3.557 | 3.234 | 6.543 |
| 6.003583561009861 | 3.558 | 3.234 | 6.543 |
| 6.00672515366345 | 3.558 | 3.234 | 6.543 |
| 6.00986674631704 | 3.559 | 3.234 | 6.543 |
| 6.01300833897063 | 3.56 | 3.235 | 6.543 |
| 6.01614993162422 | 3.56 | 3.235 | 6.543 |
| 6.019291524277808 | 3.561 | 3.235 | 6.543 |
| 6.022433116931398 | 3.561 | 3.235 | 6.543 |
| 6.025574709584988 | 3.562 | 3.235 | 6.543 |
| 6.028716302238577 | 3.562 | 3.235 | 6.543 |
| 6.031857894892167 | 3.563 | 3.235 | 6.543 |
| 6.034999487545757 | 3.563 | 3.236 | 6.543 |
| 6.038141080199346 | 3.564 | 3.236 | 6.543 |
| 6.041282672852935 | 3.564 | 3.236 | 6.544 |
| 6.044424265506525 | 3.565 | 3.236 | 6.544 |
| 6.047565858160115 | 3.565 | 3.236 | 6.544 |
| 6.050707450813704 | 3.566 | 3.236 | 6.544 |
| 6.053849043467294 | 3.566 | 3.236 | 6.544 |
| 6.056990636120884 | 3.567 | 3.236 | 6.544 |
| 6.060132228774473 | 3.567 | 3.237 | 6.544 |
| 6.063273821428063 | 3.568 | 3.237 | 6.544 |
| 6.066415414081653 | 3.568 | 3.237 | 6.544 |
| 6.069557006735242 | 3.568 | 3.237 | 6.544 |
| 6.072698599388831 | 3.569 | 3.237 | 6.544 |
| 6.07584019204242 | 3.569 | 3.237 | 6.544 |
| 6.078981784696011 | 3.569 | 3.237 | 6.544 |
| 6.082123377349601 | 3.57 | 3.237 | 6.544 |
| 6.08526497000319 | 3.57 | 3.237 | 6.544 |
| 6.08840656265678 | 3.57 | 3.237 | 6.544 |
| 6.09154815531037 | 3.571 | 3.237 | 6.544 |
| 6.094689747963959 | 3.571 | 3.238 | 6.544 |
| 6.097831340617549 | 3.571 | 3.238 | 6.544 |
| 6.100972933271138 | 3.572 | 3.238 | 6.544 |
| 6.104114525924728 | 3.572 | 3.238 | 6.544 |
| 6.107256118578317 | 3.572 | 3.238 | 6.544 |
| 6.110397711231907 | 3.572 | 3.238 | 6.544 |
| 6.113539303885497 | 3.573 | 3.238 | 6.544 |
| 6.116680896539086 | 3.573 | 3.238 | 6.545 |
| 6.119822489192675 | 3.573 | 3.238 | 6.545 |
| 6.122964081846265 | 3.573 | 3.238 | 6.545 |
| 6.126105674499855 | 3.574 | 3.238 | 6.545 |
| 6.129247267153445 | 3.574 | 3.238 | 6.545 |
| 6.132388859807034 | 3.574 | 3.238 | 6.545 |
| 6.135530452460624 | 3.574 | 3.238 | 6.545 |
| 6.138672045114213 | 3.574 | 3.238 | 6.545 |
| 6.141813637767803 | 3.574 | 3.238 | 6.545 |
| 6.144955230421393 | 3.575 | 3.238 | 6.545 |
| 6.148096823074982 | 3.575 | 3.239 | 6.545 |
| 6.151238415728571 | 3.575 | 3.239 | 6.545 |
| 6.154380008382161 | 3.575 | 3.239 | 6.545 |
| 6.157521601035751 | 3.575 | 3.239 | 6.545 |
| 6.16066319368934 | 3.575 | 3.239 | 6.545 |
| 6.16380478634293 | 3.576 | 3.239 | 6.545 |
| 6.16694637899652 | 3.576 | 3.239 | 6.545 |
| 6.170087971650109 | 3.576 | 3.239 | 6.545 |
| 6.173229564303698 | 3.576 | 3.239 | 6.545 |
| 6.176371156957289 | 3.576 | 3.239 | 6.545 |
| 6.179512749610878 | 3.576 | 3.239 | 6.545 |
| 6.182654342264468 | 3.576 | 3.239 | 6.545 |
| 6.185795934918057 | 3.576 | 3.239 | 6.545 |
| 6.188937527571647 | 3.576 | 3.239 | 6.545 |
| 6.192079120225237 | 3.576 | 3.239 | 6.545 |
| 6.195220712878826 | 3.576 | 3.239 | 6.545 |
| 6.198362305532415 | 3.577 | 3.239 | 6.545 |
| 6.201503898186005 | 3.577 | 3.239 | 6.545 |
| 6.204645490839594 | 3.577 | 3.239 | 6.545 |
| 6.207787083493184 | 3.577 | 3.239 | 6.545 |
| 6.210928676146774 | 3.577 | 3.239 | 6.545 |
| 6.214070268800364 | 3.577 | 3.239 | 6.545 |
| 6.217211861453953 | 3.577 | 3.239 | 6.545 |
| 6.220353454107543 | 3.577 | 3.239 | 6.545 |
| 6.223495046761133 | 3.577 | 3.239 | 6.545 |
| 6.226636639414722 | 3.577 | 3.239 | 6.545 |
| 6.229778232068312 | 3.577 | 3.239 | 6.545 |
| 6.232919824721901 | 3.577 | 3.239 | 6.545 |
| 6.236061417375491 | 3.577 | 3.239 | 6.545 |
| 6.23920301002908 | 3.577 | 3.239 | 6.545 |
| 6.24234460268267 | 3.577 | 3.239 | 6.545 |
| 6.24548619533626 | 3.577 | 3.239 | 6.545 |
| 6.24862778798985 | 3.577 | 3.239 | 6.545 |
| 6.251769380643438 | 3.577 | 3.239 | 6.545 |
| 6.254910973297028 | 3.577 | 3.239 | 6.545 |
| 6.258052565950618 | 3.577 | 3.239 | 6.545 |
| 6.261194158604208 | 3.577 | 3.239 | 6.545 |
| 6.264335751257797 | 3.577 | 3.239 | 6.545 |
| 6.267477343911387 | 3.577 | 3.239 | 6.545 |
| 6.270618936564976 | 3.577 | 3.239 | 6.545 |
| 6.273760529218566 | 3.577 | 3.239 | 6.545 |
| 6.276902121872155 | 3.577 | 3.239 | 6.545 |
| 6.280043714525745 | 3.577 | 3.239 | 6.545 |
| 6.283185307179335 | 3.577 | 3.239 | 6.545 |